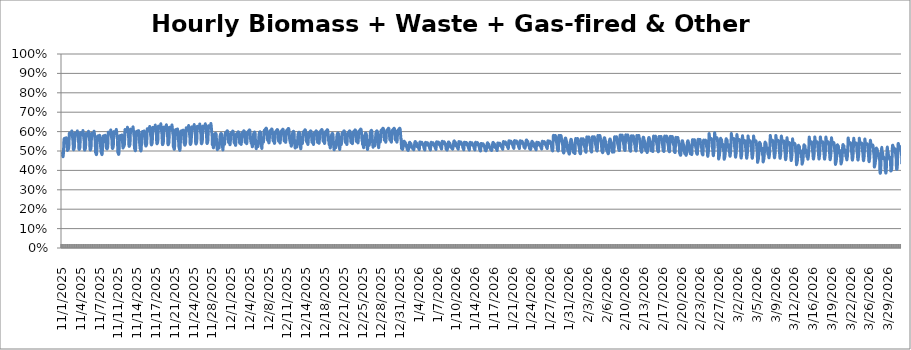
| Category | Series 0 |
|---|---|
| 11/1/25 | 0.484 |
| 11/1/25 | 0.489 |
| 11/1/25 | 0.478 |
| 11/1/25 | 0.473 |
| 11/1/25 | 0.471 |
| 11/1/25 | 0.476 |
| 11/1/25 | 0.497 |
| 11/1/25 | 0.535 |
| 11/1/25 | 0.555 |
| 11/1/25 | 0.564 |
| 11/1/25 | 0.563 |
| 11/1/25 | 0.56 |
| 11/1/25 | 0.565 |
| 11/1/25 | 0.565 |
| 11/1/25 | 0.563 |
| 11/1/25 | 0.562 |
| 11/1/25 | 0.561 |
| 11/1/25 | 0.561 |
| 11/1/25 | 0.568 |
| 11/1/25 | 0.558 |
| 11/1/25 | 0.542 |
| 11/1/25 | 0.526 |
| 11/1/25 | 0.509 |
| 11/1/25 | 0.503 |
| 11/2/25 | 0.514 |
| 11/2/25 | 0.507 |
| 11/2/25 | 0.507 |
| 11/2/25 | 0.51 |
| 11/2/25 | 0.513 |
| 11/2/25 | 0.52 |
| 11/2/25 | 0.547 |
| 11/2/25 | 0.587 |
| 11/2/25 | 0.592 |
| 11/2/25 | 0.588 |
| 11/2/25 | 0.584 |
| 11/2/25 | 0.584 |
| 11/2/25 | 0.583 |
| 11/2/25 | 0.583 |
| 11/2/25 | 0.586 |
| 11/2/25 | 0.589 |
| 11/2/25 | 0.592 |
| 11/2/25 | 0.596 |
| 11/2/25 | 0.604 |
| 11/2/25 | 0.594 |
| 11/2/25 | 0.582 |
| 11/2/25 | 0.57 |
| 11/2/25 | 0.558 |
| 11/2/25 | 0.55 |
| 11/3/25 | 0.514 |
| 11/3/25 | 0.507 |
| 11/3/25 | 0.507 |
| 11/3/25 | 0.51 |
| 11/3/25 | 0.513 |
| 11/3/25 | 0.52 |
| 11/3/25 | 0.547 |
| 11/3/25 | 0.587 |
| 11/3/25 | 0.592 |
| 11/3/25 | 0.588 |
| 11/3/25 | 0.585 |
| 11/3/25 | 0.584 |
| 11/3/25 | 0.583 |
| 11/3/25 | 0.583 |
| 11/3/25 | 0.587 |
| 11/3/25 | 0.589 |
| 11/3/25 | 0.592 |
| 11/3/25 | 0.596 |
| 11/3/25 | 0.604 |
| 11/3/25 | 0.595 |
| 11/3/25 | 0.583 |
| 11/3/25 | 0.57 |
| 11/3/25 | 0.558 |
| 11/3/25 | 0.55 |
| 11/4/25 | 0.515 |
| 11/4/25 | 0.509 |
| 11/4/25 | 0.508 |
| 11/4/25 | 0.511 |
| 11/4/25 | 0.515 |
| 11/4/25 | 0.521 |
| 11/4/25 | 0.549 |
| 11/4/25 | 0.589 |
| 11/4/25 | 0.594 |
| 11/4/25 | 0.59 |
| 11/4/25 | 0.586 |
| 11/4/25 | 0.586 |
| 11/4/25 | 0.585 |
| 11/4/25 | 0.584 |
| 11/4/25 | 0.588 |
| 11/4/25 | 0.59 |
| 11/4/25 | 0.594 |
| 11/4/25 | 0.598 |
| 11/4/25 | 0.605 |
| 11/4/25 | 0.596 |
| 11/4/25 | 0.584 |
| 11/4/25 | 0.572 |
| 11/4/25 | 0.559 |
| 11/4/25 | 0.551 |
| 11/5/25 | 0.512 |
| 11/5/25 | 0.505 |
| 11/5/25 | 0.505 |
| 11/5/25 | 0.508 |
| 11/5/25 | 0.511 |
| 11/5/25 | 0.518 |
| 11/5/25 | 0.545 |
| 11/5/25 | 0.585 |
| 11/5/25 | 0.59 |
| 11/5/25 | 0.586 |
| 11/5/25 | 0.582 |
| 11/5/25 | 0.582 |
| 11/5/25 | 0.581 |
| 11/5/25 | 0.581 |
| 11/5/25 | 0.584 |
| 11/5/25 | 0.586 |
| 11/5/25 | 0.59 |
| 11/5/25 | 0.594 |
| 11/5/25 | 0.601 |
| 11/5/25 | 0.592 |
| 11/5/25 | 0.58 |
| 11/5/25 | 0.568 |
| 11/5/25 | 0.556 |
| 11/5/25 | 0.548 |
| 11/6/25 | 0.513 |
| 11/6/25 | 0.506 |
| 11/6/25 | 0.505 |
| 11/6/25 | 0.508 |
| 11/6/25 | 0.512 |
| 11/6/25 | 0.519 |
| 11/6/25 | 0.546 |
| 11/6/25 | 0.586 |
| 11/6/25 | 0.591 |
| 11/6/25 | 0.587 |
| 11/6/25 | 0.583 |
| 11/6/25 | 0.582 |
| 11/6/25 | 0.582 |
| 11/6/25 | 0.581 |
| 11/6/25 | 0.585 |
| 11/6/25 | 0.587 |
| 11/6/25 | 0.591 |
| 11/6/25 | 0.595 |
| 11/6/25 | 0.602 |
| 11/6/25 | 0.593 |
| 11/6/25 | 0.581 |
| 11/6/25 | 0.569 |
| 11/6/25 | 0.556 |
| 11/6/25 | 0.548 |
| 11/7/25 | 0.495 |
| 11/7/25 | 0.5 |
| 11/7/25 | 0.488 |
| 11/7/25 | 0.484 |
| 11/7/25 | 0.481 |
| 11/7/25 | 0.487 |
| 11/7/25 | 0.508 |
| 11/7/25 | 0.547 |
| 11/7/25 | 0.568 |
| 11/7/25 | 0.576 |
| 11/7/25 | 0.576 |
| 11/7/25 | 0.573 |
| 11/7/25 | 0.578 |
| 11/7/25 | 0.578 |
| 11/7/25 | 0.576 |
| 11/7/25 | 0.575 |
| 11/7/25 | 0.573 |
| 11/7/25 | 0.574 |
| 11/7/25 | 0.581 |
| 11/7/25 | 0.571 |
| 11/7/25 | 0.555 |
| 11/7/25 | 0.538 |
| 11/7/25 | 0.521 |
| 11/7/25 | 0.514 |
| 11/8/25 | 0.495 |
| 11/8/25 | 0.5 |
| 11/8/25 | 0.488 |
| 11/8/25 | 0.484 |
| 11/8/25 | 0.481 |
| 11/8/25 | 0.487 |
| 11/8/25 | 0.508 |
| 11/8/25 | 0.547 |
| 11/8/25 | 0.568 |
| 11/8/25 | 0.576 |
| 11/8/25 | 0.576 |
| 11/8/25 | 0.573 |
| 11/8/25 | 0.578 |
| 11/8/25 | 0.578 |
| 11/8/25 | 0.576 |
| 11/8/25 | 0.575 |
| 11/8/25 | 0.573 |
| 11/8/25 | 0.574 |
| 11/8/25 | 0.581 |
| 11/8/25 | 0.571 |
| 11/8/25 | 0.555 |
| 11/8/25 | 0.538 |
| 11/8/25 | 0.521 |
| 11/8/25 | 0.514 |
| 11/9/25 | 0.518 |
| 11/9/25 | 0.511 |
| 11/9/25 | 0.511 |
| 11/9/25 | 0.514 |
| 11/9/25 | 0.517 |
| 11/9/25 | 0.524 |
| 11/9/25 | 0.552 |
| 11/9/25 | 0.592 |
| 11/9/25 | 0.597 |
| 11/9/25 | 0.593 |
| 11/9/25 | 0.589 |
| 11/9/25 | 0.589 |
| 11/9/25 | 0.588 |
| 11/9/25 | 0.587 |
| 11/9/25 | 0.591 |
| 11/9/25 | 0.594 |
| 11/9/25 | 0.597 |
| 11/9/25 | 0.601 |
| 11/9/25 | 0.609 |
| 11/9/25 | 0.599 |
| 11/9/25 | 0.587 |
| 11/9/25 | 0.575 |
| 11/9/25 | 0.562 |
| 11/9/25 | 0.554 |
| 11/10/25 | 0.52 |
| 11/10/25 | 0.514 |
| 11/10/25 | 0.513 |
| 11/10/25 | 0.516 |
| 11/10/25 | 0.52 |
| 11/10/25 | 0.526 |
| 11/10/25 | 0.554 |
| 11/10/25 | 0.595 |
| 11/10/25 | 0.6 |
| 11/10/25 | 0.596 |
| 11/10/25 | 0.592 |
| 11/10/25 | 0.591 |
| 11/10/25 | 0.59 |
| 11/10/25 | 0.59 |
| 11/10/25 | 0.594 |
| 11/10/25 | 0.596 |
| 11/10/25 | 0.6 |
| 11/10/25 | 0.604 |
| 11/10/25 | 0.611 |
| 11/10/25 | 0.602 |
| 11/10/25 | 0.59 |
| 11/10/25 | 0.577 |
| 11/10/25 | 0.565 |
| 11/10/25 | 0.557 |
| 11/11/25 | 0.496 |
| 11/11/25 | 0.502 |
| 11/11/25 | 0.49 |
| 11/11/25 | 0.485 |
| 11/11/25 | 0.483 |
| 11/11/25 | 0.488 |
| 11/11/25 | 0.51 |
| 11/11/25 | 0.549 |
| 11/11/25 | 0.569 |
| 11/11/25 | 0.578 |
| 11/11/25 | 0.577 |
| 11/11/25 | 0.575 |
| 11/11/25 | 0.58 |
| 11/11/25 | 0.579 |
| 11/11/25 | 0.578 |
| 11/11/25 | 0.577 |
| 11/11/25 | 0.575 |
| 11/11/25 | 0.575 |
| 11/11/25 | 0.583 |
| 11/11/25 | 0.572 |
| 11/11/25 | 0.556 |
| 11/11/25 | 0.54 |
| 11/11/25 | 0.522 |
| 11/11/25 | 0.516 |
| 11/12/25 | 0.53 |
| 11/12/25 | 0.523 |
| 11/12/25 | 0.522 |
| 11/12/25 | 0.525 |
| 11/12/25 | 0.529 |
| 11/12/25 | 0.536 |
| 11/12/25 | 0.564 |
| 11/12/25 | 0.606 |
| 11/12/25 | 0.61 |
| 11/12/25 | 0.607 |
| 11/12/25 | 0.603 |
| 11/12/25 | 0.602 |
| 11/12/25 | 0.601 |
| 11/12/25 | 0.601 |
| 11/12/25 | 0.605 |
| 11/12/25 | 0.607 |
| 11/12/25 | 0.611 |
| 11/12/25 | 0.615 |
| 11/12/25 | 0.622 |
| 11/12/25 | 0.613 |
| 11/12/25 | 0.601 |
| 11/12/25 | 0.588 |
| 11/12/25 | 0.575 |
| 11/12/25 | 0.567 |
| 11/13/25 | 0.532 |
| 11/13/25 | 0.525 |
| 11/13/25 | 0.524 |
| 11/13/25 | 0.527 |
| 11/13/25 | 0.531 |
| 11/13/25 | 0.538 |
| 11/13/25 | 0.566 |
| 11/13/25 | 0.608 |
| 11/13/25 | 0.612 |
| 11/13/25 | 0.609 |
| 11/13/25 | 0.605 |
| 11/13/25 | 0.604 |
| 11/13/25 | 0.603 |
| 11/13/25 | 0.603 |
| 11/13/25 | 0.607 |
| 11/13/25 | 0.609 |
| 11/13/25 | 0.613 |
| 11/13/25 | 0.617 |
| 11/13/25 | 0.624 |
| 11/13/25 | 0.615 |
| 11/13/25 | 0.603 |
| 11/13/25 | 0.59 |
| 11/13/25 | 0.577 |
| 11/13/25 | 0.569 |
| 11/14/25 | 0.515 |
| 11/14/25 | 0.521 |
| 11/14/25 | 0.509 |
| 11/14/25 | 0.504 |
| 11/14/25 | 0.502 |
| 11/14/25 | 0.507 |
| 11/14/25 | 0.529 |
| 11/14/25 | 0.57 |
| 11/14/25 | 0.591 |
| 11/14/25 | 0.6 |
| 11/14/25 | 0.6 |
| 11/14/25 | 0.597 |
| 11/14/25 | 0.602 |
| 11/14/25 | 0.602 |
| 11/14/25 | 0.6 |
| 11/14/25 | 0.599 |
| 11/14/25 | 0.597 |
| 11/14/25 | 0.597 |
| 11/14/25 | 0.605 |
| 11/14/25 | 0.594 |
| 11/14/25 | 0.578 |
| 11/14/25 | 0.561 |
| 11/14/25 | 0.542 |
| 11/14/25 | 0.536 |
| 11/15/25 | 0.514 |
| 11/15/25 | 0.52 |
| 11/15/25 | 0.507 |
| 11/15/25 | 0.503 |
| 11/15/25 | 0.5 |
| 11/15/25 | 0.506 |
| 11/15/25 | 0.528 |
| 11/15/25 | 0.568 |
| 11/15/25 | 0.59 |
| 11/15/25 | 0.599 |
| 11/15/25 | 0.598 |
| 11/15/25 | 0.595 |
| 11/15/25 | 0.601 |
| 11/15/25 | 0.6 |
| 11/15/25 | 0.599 |
| 11/15/25 | 0.597 |
| 11/15/25 | 0.596 |
| 11/15/25 | 0.596 |
| 11/15/25 | 0.604 |
| 11/15/25 | 0.593 |
| 11/15/25 | 0.576 |
| 11/15/25 | 0.559 |
| 11/15/25 | 0.541 |
| 11/15/25 | 0.534 |
| 11/16/25 | 0.533 |
| 11/16/25 | 0.526 |
| 11/16/25 | 0.526 |
| 11/16/25 | 0.529 |
| 11/16/25 | 0.533 |
| 11/16/25 | 0.54 |
| 11/16/25 | 0.568 |
| 11/16/25 | 0.61 |
| 11/16/25 | 0.614 |
| 11/16/25 | 0.611 |
| 11/16/25 | 0.607 |
| 11/16/25 | 0.606 |
| 11/16/25 | 0.605 |
| 11/16/25 | 0.605 |
| 11/16/25 | 0.609 |
| 11/16/25 | 0.611 |
| 11/16/25 | 0.615 |
| 11/16/25 | 0.619 |
| 11/16/25 | 0.627 |
| 11/16/25 | 0.617 |
| 11/16/25 | 0.605 |
| 11/16/25 | 0.592 |
| 11/16/25 | 0.579 |
| 11/16/25 | 0.571 |
| 11/17/25 | 0.539 |
| 11/17/25 | 0.532 |
| 11/17/25 | 0.532 |
| 11/17/25 | 0.535 |
| 11/17/25 | 0.539 |
| 11/17/25 | 0.546 |
| 11/17/25 | 0.574 |
| 11/17/25 | 0.616 |
| 11/17/25 | 0.621 |
| 11/17/25 | 0.617 |
| 11/17/25 | 0.613 |
| 11/17/25 | 0.613 |
| 11/17/25 | 0.612 |
| 11/17/25 | 0.612 |
| 11/17/25 | 0.616 |
| 11/17/25 | 0.618 |
| 11/17/25 | 0.622 |
| 11/17/25 | 0.626 |
| 11/17/25 | 0.634 |
| 11/17/25 | 0.624 |
| 11/17/25 | 0.611 |
| 11/17/25 | 0.598 |
| 11/17/25 | 0.585 |
| 11/17/25 | 0.577 |
| 11/18/25 | 0.545 |
| 11/18/25 | 0.538 |
| 11/18/25 | 0.537 |
| 11/18/25 | 0.54 |
| 11/18/25 | 0.544 |
| 11/18/25 | 0.551 |
| 11/18/25 | 0.58 |
| 11/18/25 | 0.623 |
| 11/18/25 | 0.628 |
| 11/18/25 | 0.624 |
| 11/18/25 | 0.62 |
| 11/18/25 | 0.619 |
| 11/18/25 | 0.618 |
| 11/18/25 | 0.618 |
| 11/18/25 | 0.622 |
| 11/18/25 | 0.624 |
| 11/18/25 | 0.628 |
| 11/18/25 | 0.632 |
| 11/18/25 | 0.64 |
| 11/18/25 | 0.631 |
| 11/18/25 | 0.618 |
| 11/18/25 | 0.604 |
| 11/18/25 | 0.591 |
| 11/18/25 | 0.583 |
| 11/19/25 | 0.541 |
| 11/19/25 | 0.533 |
| 11/19/25 | 0.533 |
| 11/19/25 | 0.536 |
| 11/19/25 | 0.54 |
| 11/19/25 | 0.547 |
| 11/19/25 | 0.576 |
| 11/19/25 | 0.618 |
| 11/19/25 | 0.623 |
| 11/19/25 | 0.619 |
| 11/19/25 | 0.615 |
| 11/19/25 | 0.614 |
| 11/19/25 | 0.613 |
| 11/19/25 | 0.613 |
| 11/19/25 | 0.617 |
| 11/19/25 | 0.619 |
| 11/19/25 | 0.623 |
| 11/19/25 | 0.627 |
| 11/19/25 | 0.635 |
| 11/19/25 | 0.625 |
| 11/19/25 | 0.613 |
| 11/19/25 | 0.6 |
| 11/19/25 | 0.587 |
| 11/19/25 | 0.578 |
| 11/20/25 | 0.54 |
| 11/20/25 | 0.533 |
| 11/20/25 | 0.532 |
| 11/20/25 | 0.535 |
| 11/20/25 | 0.539 |
| 11/20/25 | 0.546 |
| 11/20/25 | 0.575 |
| 11/20/25 | 0.617 |
| 11/20/25 | 0.622 |
| 11/20/25 | 0.618 |
| 11/20/25 | 0.614 |
| 11/20/25 | 0.613 |
| 11/20/25 | 0.613 |
| 11/20/25 | 0.612 |
| 11/20/25 | 0.616 |
| 11/20/25 | 0.619 |
| 11/20/25 | 0.623 |
| 11/20/25 | 0.626 |
| 11/20/25 | 0.634 |
| 11/20/25 | 0.625 |
| 11/20/25 | 0.612 |
| 11/20/25 | 0.599 |
| 11/20/25 | 0.586 |
| 11/20/25 | 0.578 |
| 11/21/25 | 0.523 |
| 11/21/25 | 0.529 |
| 11/21/25 | 0.516 |
| 11/21/25 | 0.511 |
| 11/21/25 | 0.508 |
| 11/21/25 | 0.514 |
| 11/21/25 | 0.537 |
| 11/21/25 | 0.578 |
| 11/21/25 | 0.6 |
| 11/21/25 | 0.609 |
| 11/21/25 | 0.608 |
| 11/21/25 | 0.605 |
| 11/21/25 | 0.611 |
| 11/21/25 | 0.61 |
| 11/21/25 | 0.609 |
| 11/21/25 | 0.607 |
| 11/21/25 | 0.606 |
| 11/21/25 | 0.606 |
| 11/21/25 | 0.614 |
| 11/21/25 | 0.603 |
| 11/21/25 | 0.586 |
| 11/21/25 | 0.568 |
| 11/21/25 | 0.55 |
| 11/21/25 | 0.543 |
| 11/22/25 | 0.517 |
| 11/22/25 | 0.523 |
| 11/22/25 | 0.511 |
| 11/22/25 | 0.506 |
| 11/22/25 | 0.504 |
| 11/22/25 | 0.509 |
| 11/22/25 | 0.531 |
| 11/22/25 | 0.572 |
| 11/22/25 | 0.594 |
| 11/22/25 | 0.603 |
| 11/22/25 | 0.602 |
| 11/22/25 | 0.599 |
| 11/22/25 | 0.605 |
| 11/22/25 | 0.604 |
| 11/22/25 | 0.603 |
| 11/22/25 | 0.601 |
| 11/22/25 | 0.6 |
| 11/22/25 | 0.6 |
| 11/22/25 | 0.608 |
| 11/22/25 | 0.597 |
| 11/22/25 | 0.58 |
| 11/22/25 | 0.563 |
| 11/22/25 | 0.545 |
| 11/22/25 | 0.538 |
| 11/23/25 | 0.538 |
| 11/23/25 | 0.53 |
| 11/23/25 | 0.53 |
| 11/23/25 | 0.533 |
| 11/23/25 | 0.537 |
| 11/23/25 | 0.544 |
| 11/23/25 | 0.572 |
| 11/23/25 | 0.614 |
| 11/23/25 | 0.619 |
| 11/23/25 | 0.615 |
| 11/23/25 | 0.611 |
| 11/23/25 | 0.611 |
| 11/23/25 | 0.61 |
| 11/23/25 | 0.61 |
| 11/23/25 | 0.614 |
| 11/23/25 | 0.616 |
| 11/23/25 | 0.62 |
| 11/23/25 | 0.624 |
| 11/23/25 | 0.632 |
| 11/23/25 | 0.622 |
| 11/23/25 | 0.609 |
| 11/23/25 | 0.596 |
| 11/23/25 | 0.583 |
| 11/23/25 | 0.575 |
| 11/24/25 | 0.542 |
| 11/24/25 | 0.534 |
| 11/24/25 | 0.534 |
| 11/24/25 | 0.537 |
| 11/24/25 | 0.541 |
| 11/24/25 | 0.548 |
| 11/24/25 | 0.577 |
| 11/24/25 | 0.619 |
| 11/24/25 | 0.624 |
| 11/24/25 | 0.62 |
| 11/24/25 | 0.616 |
| 11/24/25 | 0.615 |
| 11/24/25 | 0.614 |
| 11/24/25 | 0.614 |
| 11/24/25 | 0.618 |
| 11/24/25 | 0.62 |
| 11/24/25 | 0.624 |
| 11/24/25 | 0.628 |
| 11/24/25 | 0.636 |
| 11/24/25 | 0.627 |
| 11/24/25 | 0.614 |
| 11/24/25 | 0.601 |
| 11/24/25 | 0.588 |
| 11/24/25 | 0.579 |
| 11/25/25 | 0.544 |
| 11/25/25 | 0.537 |
| 11/25/25 | 0.536 |
| 11/25/25 | 0.539 |
| 11/25/25 | 0.543 |
| 11/25/25 | 0.55 |
| 11/25/25 | 0.579 |
| 11/25/25 | 0.622 |
| 11/25/25 | 0.627 |
| 11/25/25 | 0.623 |
| 11/25/25 | 0.619 |
| 11/25/25 | 0.618 |
| 11/25/25 | 0.617 |
| 11/25/25 | 0.617 |
| 11/25/25 | 0.621 |
| 11/25/25 | 0.623 |
| 11/25/25 | 0.627 |
| 11/25/25 | 0.631 |
| 11/25/25 | 0.639 |
| 11/25/25 | 0.629 |
| 11/25/25 | 0.617 |
| 11/25/25 | 0.603 |
| 11/25/25 | 0.59 |
| 11/25/25 | 0.582 |
| 11/26/25 | 0.545 |
| 11/26/25 | 0.538 |
| 11/26/25 | 0.537 |
| 11/26/25 | 0.541 |
| 11/26/25 | 0.544 |
| 11/26/25 | 0.551 |
| 11/26/25 | 0.58 |
| 11/26/25 | 0.623 |
| 11/26/25 | 0.628 |
| 11/26/25 | 0.624 |
| 11/26/25 | 0.62 |
| 11/26/25 | 0.619 |
| 11/26/25 | 0.618 |
| 11/26/25 | 0.618 |
| 11/26/25 | 0.622 |
| 11/26/25 | 0.624 |
| 11/26/25 | 0.628 |
| 11/26/25 | 0.632 |
| 11/26/25 | 0.64 |
| 11/26/25 | 0.631 |
| 11/26/25 | 0.618 |
| 11/26/25 | 0.605 |
| 11/26/25 | 0.591 |
| 11/26/25 | 0.583 |
| 11/27/25 | 0.547 |
| 11/27/25 | 0.539 |
| 11/27/25 | 0.539 |
| 11/27/25 | 0.542 |
| 11/27/25 | 0.546 |
| 11/27/25 | 0.553 |
| 11/27/25 | 0.582 |
| 11/27/25 | 0.625 |
| 11/27/25 | 0.63 |
| 11/27/25 | 0.626 |
| 11/27/25 | 0.622 |
| 11/27/25 | 0.621 |
| 11/27/25 | 0.62 |
| 11/27/25 | 0.62 |
| 11/27/25 | 0.624 |
| 11/27/25 | 0.626 |
| 11/27/25 | 0.63 |
| 11/27/25 | 0.634 |
| 11/27/25 | 0.642 |
| 11/27/25 | 0.632 |
| 11/27/25 | 0.62 |
| 11/27/25 | 0.606 |
| 11/27/25 | 0.593 |
| 11/27/25 | 0.585 |
| 11/28/25 | 0.534 |
| 11/28/25 | 0.542 |
| 11/28/25 | 0.538 |
| 11/28/25 | 0.531 |
| 11/28/25 | 0.52 |
| 11/28/25 | 0.516 |
| 11/28/25 | 0.525 |
| 11/28/25 | 0.535 |
| 11/28/25 | 0.553 |
| 11/28/25 | 0.57 |
| 11/28/25 | 0.582 |
| 11/28/25 | 0.584 |
| 11/28/25 | 0.59 |
| 11/28/25 | 0.588 |
| 11/28/25 | 0.592 |
| 11/28/25 | 0.59 |
| 11/28/25 | 0.589 |
| 11/28/25 | 0.582 |
| 11/28/25 | 0.552 |
| 11/28/25 | 0.536 |
| 11/28/25 | 0.523 |
| 11/28/25 | 0.51 |
| 11/28/25 | 0.508 |
| 11/28/25 | 0.526 |
| 11/29/25 | 0.533 |
| 11/29/25 | 0.541 |
| 11/29/25 | 0.537 |
| 11/29/25 | 0.53 |
| 11/29/25 | 0.519 |
| 11/29/25 | 0.515 |
| 11/29/25 | 0.524 |
| 11/29/25 | 0.533 |
| 11/29/25 | 0.551 |
| 11/29/25 | 0.569 |
| 11/29/25 | 0.58 |
| 11/29/25 | 0.583 |
| 11/29/25 | 0.588 |
| 11/29/25 | 0.587 |
| 11/29/25 | 0.59 |
| 11/29/25 | 0.589 |
| 11/29/25 | 0.587 |
| 11/29/25 | 0.58 |
| 11/29/25 | 0.551 |
| 11/29/25 | 0.535 |
| 11/29/25 | 0.522 |
| 11/29/25 | 0.509 |
| 11/29/25 | 0.507 |
| 11/29/25 | 0.525 |
| 11/30/25 | 0.546 |
| 11/30/25 | 0.543 |
| 11/30/25 | 0.542 |
| 11/30/25 | 0.54 |
| 11/30/25 | 0.534 |
| 11/30/25 | 0.537 |
| 11/30/25 | 0.552 |
| 11/30/25 | 0.579 |
| 11/30/25 | 0.593 |
| 11/30/25 | 0.593 |
| 11/30/25 | 0.595 |
| 11/30/25 | 0.595 |
| 11/30/25 | 0.598 |
| 11/30/25 | 0.599 |
| 11/30/25 | 0.6 |
| 11/30/25 | 0.602 |
| 11/30/25 | 0.604 |
| 11/30/25 | 0.602 |
| 11/30/25 | 0.602 |
| 11/30/25 | 0.591 |
| 11/30/25 | 0.579 |
| 11/30/25 | 0.559 |
| 11/30/25 | 0.545 |
| 11/30/25 | 0.549 |
| 12/1/25 | 0.544 |
| 12/1/25 | 0.542 |
| 12/1/25 | 0.54 |
| 12/1/25 | 0.539 |
| 12/1/25 | 0.533 |
| 12/1/25 | 0.535 |
| 12/1/25 | 0.55 |
| 12/1/25 | 0.577 |
| 12/1/25 | 0.591 |
| 12/1/25 | 0.592 |
| 12/1/25 | 0.594 |
| 12/1/25 | 0.594 |
| 12/1/25 | 0.597 |
| 12/1/25 | 0.598 |
| 12/1/25 | 0.599 |
| 12/1/25 | 0.601 |
| 12/1/25 | 0.603 |
| 12/1/25 | 0.601 |
| 12/1/25 | 0.6 |
| 12/1/25 | 0.59 |
| 12/1/25 | 0.577 |
| 12/1/25 | 0.558 |
| 12/1/25 | 0.544 |
| 12/1/25 | 0.548 |
| 12/2/25 | 0.541 |
| 12/2/25 | 0.539 |
| 12/2/25 | 0.537 |
| 12/2/25 | 0.536 |
| 12/2/25 | 0.529 |
| 12/2/25 | 0.532 |
| 12/2/25 | 0.547 |
| 12/2/25 | 0.573 |
| 12/2/25 | 0.587 |
| 12/2/25 | 0.588 |
| 12/2/25 | 0.59 |
| 12/2/25 | 0.59 |
| 12/2/25 | 0.593 |
| 12/2/25 | 0.594 |
| 12/2/25 | 0.595 |
| 12/2/25 | 0.597 |
| 12/2/25 | 0.599 |
| 12/2/25 | 0.597 |
| 12/2/25 | 0.596 |
| 12/2/25 | 0.586 |
| 12/2/25 | 0.574 |
| 12/2/25 | 0.554 |
| 12/2/25 | 0.54 |
| 12/2/25 | 0.544 |
| 12/3/25 | 0.546 |
| 12/3/25 | 0.543 |
| 12/3/25 | 0.542 |
| 12/3/25 | 0.54 |
| 12/3/25 | 0.534 |
| 12/3/25 | 0.537 |
| 12/3/25 | 0.552 |
| 12/3/25 | 0.579 |
| 12/3/25 | 0.593 |
| 12/3/25 | 0.593 |
| 12/3/25 | 0.595 |
| 12/3/25 | 0.595 |
| 12/3/25 | 0.598 |
| 12/3/25 | 0.599 |
| 12/3/25 | 0.6 |
| 12/3/25 | 0.602 |
| 12/3/25 | 0.604 |
| 12/3/25 | 0.603 |
| 12/3/25 | 0.602 |
| 12/3/25 | 0.591 |
| 12/3/25 | 0.579 |
| 12/3/25 | 0.559 |
| 12/3/25 | 0.545 |
| 12/3/25 | 0.549 |
| 12/4/25 | 0.55 |
| 12/4/25 | 0.547 |
| 12/4/25 | 0.546 |
| 12/4/25 | 0.544 |
| 12/4/25 | 0.538 |
| 12/4/25 | 0.541 |
| 12/4/25 | 0.556 |
| 12/4/25 | 0.583 |
| 12/4/25 | 0.597 |
| 12/4/25 | 0.597 |
| 12/4/25 | 0.6 |
| 12/4/25 | 0.6 |
| 12/4/25 | 0.602 |
| 12/4/25 | 0.604 |
| 12/4/25 | 0.604 |
| 12/4/25 | 0.606 |
| 12/4/25 | 0.609 |
| 12/4/25 | 0.607 |
| 12/4/25 | 0.606 |
| 12/4/25 | 0.595 |
| 12/4/25 | 0.583 |
| 12/4/25 | 0.563 |
| 12/4/25 | 0.549 |
| 12/4/25 | 0.553 |
| 12/5/25 | 0.54 |
| 12/5/25 | 0.548 |
| 12/5/25 | 0.544 |
| 12/5/25 | 0.537 |
| 12/5/25 | 0.525 |
| 12/5/25 | 0.522 |
| 12/5/25 | 0.531 |
| 12/5/25 | 0.54 |
| 12/5/25 | 0.558 |
| 12/5/25 | 0.576 |
| 12/5/25 | 0.588 |
| 12/5/25 | 0.59 |
| 12/5/25 | 0.596 |
| 12/5/25 | 0.594 |
| 12/5/25 | 0.598 |
| 12/5/25 | 0.596 |
| 12/5/25 | 0.595 |
| 12/5/25 | 0.588 |
| 12/5/25 | 0.558 |
| 12/5/25 | 0.542 |
| 12/5/25 | 0.529 |
| 12/5/25 | 0.515 |
| 12/5/25 | 0.513 |
| 12/5/25 | 0.532 |
| 12/6/25 | 0.541 |
| 12/6/25 | 0.549 |
| 12/6/25 | 0.545 |
| 12/6/25 | 0.538 |
| 12/6/25 | 0.526 |
| 12/6/25 | 0.523 |
| 12/6/25 | 0.532 |
| 12/6/25 | 0.541 |
| 12/6/25 | 0.56 |
| 12/6/25 | 0.577 |
| 12/6/25 | 0.589 |
| 12/6/25 | 0.591 |
| 12/6/25 | 0.597 |
| 12/6/25 | 0.595 |
| 12/6/25 | 0.599 |
| 12/6/25 | 0.597 |
| 12/6/25 | 0.596 |
| 12/6/25 | 0.589 |
| 12/6/25 | 0.559 |
| 12/6/25 | 0.543 |
| 12/6/25 | 0.53 |
| 12/6/25 | 0.516 |
| 12/6/25 | 0.514 |
| 12/6/25 | 0.533 |
| 12/7/25 | 0.558 |
| 12/7/25 | 0.556 |
| 12/7/25 | 0.554 |
| 12/7/25 | 0.552 |
| 12/7/25 | 0.546 |
| 12/7/25 | 0.549 |
| 12/7/25 | 0.564 |
| 12/7/25 | 0.591 |
| 12/7/25 | 0.606 |
| 12/7/25 | 0.606 |
| 12/7/25 | 0.608 |
| 12/7/25 | 0.608 |
| 12/7/25 | 0.611 |
| 12/7/25 | 0.613 |
| 12/7/25 | 0.613 |
| 12/7/25 | 0.615 |
| 12/7/25 | 0.618 |
| 12/7/25 | 0.616 |
| 12/7/25 | 0.615 |
| 12/7/25 | 0.604 |
| 12/7/25 | 0.592 |
| 12/7/25 | 0.572 |
| 12/7/25 | 0.557 |
| 12/7/25 | 0.561 |
| 12/8/25 | 0.554 |
| 12/8/25 | 0.552 |
| 12/8/25 | 0.55 |
| 12/8/25 | 0.549 |
| 12/8/25 | 0.542 |
| 12/8/25 | 0.545 |
| 12/8/25 | 0.56 |
| 12/8/25 | 0.587 |
| 12/8/25 | 0.602 |
| 12/8/25 | 0.602 |
| 12/8/25 | 0.604 |
| 12/8/25 | 0.604 |
| 12/8/25 | 0.607 |
| 12/8/25 | 0.608 |
| 12/8/25 | 0.609 |
| 12/8/25 | 0.611 |
| 12/8/25 | 0.614 |
| 12/8/25 | 0.612 |
| 12/8/25 | 0.611 |
| 12/8/25 | 0.6 |
| 12/8/25 | 0.587 |
| 12/8/25 | 0.568 |
| 12/8/25 | 0.553 |
| 12/8/25 | 0.557 |
| 12/9/25 | 0.551 |
| 12/9/25 | 0.549 |
| 12/9/25 | 0.547 |
| 12/9/25 | 0.546 |
| 12/9/25 | 0.539 |
| 12/9/25 | 0.542 |
| 12/9/25 | 0.557 |
| 12/9/25 | 0.584 |
| 12/9/25 | 0.599 |
| 12/9/25 | 0.599 |
| 12/9/25 | 0.601 |
| 12/9/25 | 0.601 |
| 12/9/25 | 0.604 |
| 12/9/25 | 0.605 |
| 12/9/25 | 0.606 |
| 12/9/25 | 0.608 |
| 12/9/25 | 0.611 |
| 12/9/25 | 0.609 |
| 12/9/25 | 0.608 |
| 12/9/25 | 0.597 |
| 12/9/25 | 0.585 |
| 12/9/25 | 0.565 |
| 12/9/25 | 0.551 |
| 12/9/25 | 0.555 |
| 12/10/25 | 0.553 |
| 12/10/25 | 0.551 |
| 12/10/25 | 0.549 |
| 12/10/25 | 0.548 |
| 12/10/25 | 0.541 |
| 12/10/25 | 0.544 |
| 12/10/25 | 0.559 |
| 12/10/25 | 0.586 |
| 12/10/25 | 0.601 |
| 12/10/25 | 0.601 |
| 12/10/25 | 0.603 |
| 12/10/25 | 0.603 |
| 12/10/25 | 0.606 |
| 12/10/25 | 0.607 |
| 12/10/25 | 0.608 |
| 12/10/25 | 0.61 |
| 12/10/25 | 0.613 |
| 12/10/25 | 0.611 |
| 12/10/25 | 0.61 |
| 12/10/25 | 0.599 |
| 12/10/25 | 0.587 |
| 12/10/25 | 0.567 |
| 12/10/25 | 0.552 |
| 12/10/25 | 0.557 |
| 12/11/25 | 0.557 |
| 12/11/25 | 0.554 |
| 12/11/25 | 0.552 |
| 12/11/25 | 0.551 |
| 12/11/25 | 0.545 |
| 12/11/25 | 0.547 |
| 12/11/25 | 0.563 |
| 12/11/25 | 0.59 |
| 12/11/25 | 0.604 |
| 12/11/25 | 0.605 |
| 12/11/25 | 0.607 |
| 12/11/25 | 0.607 |
| 12/11/25 | 0.61 |
| 12/11/25 | 0.611 |
| 12/11/25 | 0.612 |
| 12/11/25 | 0.614 |
| 12/11/25 | 0.617 |
| 12/11/25 | 0.615 |
| 12/11/25 | 0.614 |
| 12/11/25 | 0.603 |
| 12/11/25 | 0.59 |
| 12/11/25 | 0.57 |
| 12/11/25 | 0.556 |
| 12/11/25 | 0.56 |
| 12/12/25 | 0.543 |
| 12/12/25 | 0.551 |
| 12/12/25 | 0.547 |
| 12/12/25 | 0.54 |
| 12/12/25 | 0.528 |
| 12/12/25 | 0.525 |
| 12/12/25 | 0.534 |
| 12/12/25 | 0.543 |
| 12/12/25 | 0.562 |
| 12/12/25 | 0.579 |
| 12/12/25 | 0.591 |
| 12/12/25 | 0.594 |
| 12/12/25 | 0.6 |
| 12/12/25 | 0.598 |
| 12/12/25 | 0.602 |
| 12/12/25 | 0.6 |
| 12/12/25 | 0.598 |
| 12/12/25 | 0.591 |
| 12/12/25 | 0.562 |
| 12/12/25 | 0.545 |
| 12/12/25 | 0.532 |
| 12/12/25 | 0.519 |
| 12/12/25 | 0.516 |
| 12/12/25 | 0.535 |
| 12/13/25 | 0.539 |
| 12/13/25 | 0.547 |
| 12/13/25 | 0.543 |
| 12/13/25 | 0.536 |
| 12/13/25 | 0.524 |
| 12/13/25 | 0.521 |
| 12/13/25 | 0.53 |
| 12/13/25 | 0.539 |
| 12/13/25 | 0.558 |
| 12/13/25 | 0.575 |
| 12/13/25 | 0.587 |
| 12/13/25 | 0.589 |
| 12/13/25 | 0.595 |
| 12/13/25 | 0.593 |
| 12/13/25 | 0.597 |
| 12/13/25 | 0.595 |
| 12/13/25 | 0.594 |
| 12/13/25 | 0.587 |
| 12/13/25 | 0.557 |
| 12/13/25 | 0.541 |
| 12/13/25 | 0.528 |
| 12/13/25 | 0.515 |
| 12/13/25 | 0.512 |
| 12/13/25 | 0.531 |
| 12/14/25 | 0.55 |
| 12/14/25 | 0.548 |
| 12/14/25 | 0.546 |
| 12/14/25 | 0.545 |
| 12/14/25 | 0.538 |
| 12/14/25 | 0.541 |
| 12/14/25 | 0.556 |
| 12/14/25 | 0.583 |
| 12/14/25 | 0.597 |
| 12/14/25 | 0.598 |
| 12/14/25 | 0.6 |
| 12/14/25 | 0.6 |
| 12/14/25 | 0.603 |
| 12/14/25 | 0.604 |
| 12/14/25 | 0.605 |
| 12/14/25 | 0.607 |
| 12/14/25 | 0.609 |
| 12/14/25 | 0.608 |
| 12/14/25 | 0.607 |
| 12/14/25 | 0.596 |
| 12/14/25 | 0.584 |
| 12/14/25 | 0.564 |
| 12/14/25 | 0.549 |
| 12/14/25 | 0.554 |
| 12/15/25 | 0.545 |
| 12/15/25 | 0.543 |
| 12/15/25 | 0.542 |
| 12/15/25 | 0.54 |
| 12/15/25 | 0.534 |
| 12/15/25 | 0.536 |
| 12/15/25 | 0.552 |
| 12/15/25 | 0.578 |
| 12/15/25 | 0.592 |
| 12/15/25 | 0.593 |
| 12/15/25 | 0.595 |
| 12/15/25 | 0.595 |
| 12/15/25 | 0.598 |
| 12/15/25 | 0.599 |
| 12/15/25 | 0.6 |
| 12/15/25 | 0.602 |
| 12/15/25 | 0.604 |
| 12/15/25 | 0.602 |
| 12/15/25 | 0.602 |
| 12/15/25 | 0.591 |
| 12/15/25 | 0.579 |
| 12/15/25 | 0.559 |
| 12/15/25 | 0.545 |
| 12/15/25 | 0.549 |
| 12/16/25 | 0.545 |
| 12/16/25 | 0.543 |
| 12/16/25 | 0.541 |
| 12/16/25 | 0.54 |
| 12/16/25 | 0.534 |
| 12/16/25 | 0.536 |
| 12/16/25 | 0.551 |
| 12/16/25 | 0.578 |
| 12/16/25 | 0.592 |
| 12/16/25 | 0.593 |
| 12/16/25 | 0.595 |
| 12/16/25 | 0.595 |
| 12/16/25 | 0.598 |
| 12/16/25 | 0.599 |
| 12/16/25 | 0.6 |
| 12/16/25 | 0.602 |
| 12/16/25 | 0.604 |
| 12/16/25 | 0.602 |
| 12/16/25 | 0.602 |
| 12/16/25 | 0.591 |
| 12/16/25 | 0.578 |
| 12/16/25 | 0.559 |
| 12/16/25 | 0.545 |
| 12/16/25 | 0.549 |
| 12/17/25 | 0.551 |
| 12/17/25 | 0.549 |
| 12/17/25 | 0.547 |
| 12/17/25 | 0.546 |
| 12/17/25 | 0.54 |
| 12/17/25 | 0.542 |
| 12/17/25 | 0.557 |
| 12/17/25 | 0.585 |
| 12/17/25 | 0.599 |
| 12/17/25 | 0.599 |
| 12/17/25 | 0.601 |
| 12/17/25 | 0.601 |
| 12/17/25 | 0.604 |
| 12/17/25 | 0.605 |
| 12/17/25 | 0.606 |
| 12/17/25 | 0.608 |
| 12/17/25 | 0.611 |
| 12/17/25 | 0.609 |
| 12/17/25 | 0.608 |
| 12/17/25 | 0.597 |
| 12/17/25 | 0.585 |
| 12/17/25 | 0.565 |
| 12/17/25 | 0.551 |
| 12/17/25 | 0.555 |
| 12/18/25 | 0.551 |
| 12/18/25 | 0.548 |
| 12/18/25 | 0.547 |
| 12/18/25 | 0.545 |
| 12/18/25 | 0.539 |
| 12/18/25 | 0.542 |
| 12/18/25 | 0.557 |
| 12/18/25 | 0.584 |
| 12/18/25 | 0.598 |
| 12/18/25 | 0.598 |
| 12/18/25 | 0.601 |
| 12/18/25 | 0.601 |
| 12/18/25 | 0.604 |
| 12/18/25 | 0.605 |
| 12/18/25 | 0.606 |
| 12/18/25 | 0.608 |
| 12/18/25 | 0.61 |
| 12/18/25 | 0.608 |
| 12/18/25 | 0.607 |
| 12/18/25 | 0.596 |
| 12/18/25 | 0.584 |
| 12/18/25 | 0.564 |
| 12/18/25 | 0.55 |
| 12/18/25 | 0.554 |
| 12/19/25 | 0.533 |
| 12/19/25 | 0.541 |
| 12/19/25 | 0.537 |
| 12/19/25 | 0.53 |
| 12/19/25 | 0.519 |
| 12/19/25 | 0.516 |
| 12/19/25 | 0.525 |
| 12/19/25 | 0.534 |
| 12/19/25 | 0.552 |
| 12/19/25 | 0.569 |
| 12/19/25 | 0.581 |
| 12/19/25 | 0.583 |
| 12/19/25 | 0.589 |
| 12/19/25 | 0.587 |
| 12/19/25 | 0.591 |
| 12/19/25 | 0.589 |
| 12/19/25 | 0.588 |
| 12/19/25 | 0.581 |
| 12/19/25 | 0.552 |
| 12/19/25 | 0.536 |
| 12/19/25 | 0.523 |
| 12/19/25 | 0.509 |
| 12/19/25 | 0.507 |
| 12/19/25 | 0.526 |
| 12/20/25 | 0.535 |
| 12/20/25 | 0.543 |
| 12/20/25 | 0.539 |
| 12/20/25 | 0.532 |
| 12/20/25 | 0.521 |
| 12/20/25 | 0.518 |
| 12/20/25 | 0.526 |
| 12/20/25 | 0.536 |
| 12/20/25 | 0.554 |
| 12/20/25 | 0.571 |
| 12/20/25 | 0.583 |
| 12/20/25 | 0.585 |
| 12/20/25 | 0.591 |
| 12/20/25 | 0.589 |
| 12/20/25 | 0.593 |
| 12/20/25 | 0.591 |
| 12/20/25 | 0.59 |
| 12/20/25 | 0.583 |
| 12/20/25 | 0.554 |
| 12/20/25 | 0.537 |
| 12/20/25 | 0.525 |
| 12/20/25 | 0.511 |
| 12/20/25 | 0.509 |
| 12/20/25 | 0.527 |
| 12/21/25 | 0.545 |
| 12/21/25 | 0.543 |
| 12/21/25 | 0.541 |
| 12/21/25 | 0.54 |
| 12/21/25 | 0.534 |
| 12/21/25 | 0.536 |
| 12/21/25 | 0.551 |
| 12/21/25 | 0.578 |
| 12/21/25 | 0.592 |
| 12/21/25 | 0.593 |
| 12/21/25 | 0.595 |
| 12/21/25 | 0.595 |
| 12/21/25 | 0.598 |
| 12/21/25 | 0.599 |
| 12/21/25 | 0.6 |
| 12/21/25 | 0.602 |
| 12/21/25 | 0.604 |
| 12/21/25 | 0.602 |
| 12/21/25 | 0.601 |
| 12/21/25 | 0.591 |
| 12/21/25 | 0.578 |
| 12/21/25 | 0.559 |
| 12/21/25 | 0.545 |
| 12/21/25 | 0.549 |
| 12/22/25 | 0.545 |
| 12/22/25 | 0.543 |
| 12/22/25 | 0.541 |
| 12/22/25 | 0.54 |
| 12/22/25 | 0.534 |
| 12/22/25 | 0.536 |
| 12/22/25 | 0.551 |
| 12/22/25 | 0.578 |
| 12/22/25 | 0.592 |
| 12/22/25 | 0.593 |
| 12/22/25 | 0.595 |
| 12/22/25 | 0.595 |
| 12/22/25 | 0.598 |
| 12/22/25 | 0.599 |
| 12/22/25 | 0.6 |
| 12/22/25 | 0.602 |
| 12/22/25 | 0.604 |
| 12/22/25 | 0.602 |
| 12/22/25 | 0.601 |
| 12/22/25 | 0.591 |
| 12/22/25 | 0.578 |
| 12/22/25 | 0.559 |
| 12/22/25 | 0.545 |
| 12/22/25 | 0.549 |
| 12/23/25 | 0.55 |
| 12/23/25 | 0.548 |
| 12/23/25 | 0.546 |
| 12/23/25 | 0.545 |
| 12/23/25 | 0.538 |
| 12/23/25 | 0.541 |
| 12/23/25 | 0.556 |
| 12/23/25 | 0.583 |
| 12/23/25 | 0.597 |
| 12/23/25 | 0.598 |
| 12/23/25 | 0.6 |
| 12/23/25 | 0.6 |
| 12/23/25 | 0.603 |
| 12/23/25 | 0.604 |
| 12/23/25 | 0.605 |
| 12/23/25 | 0.607 |
| 12/23/25 | 0.609 |
| 12/23/25 | 0.607 |
| 12/23/25 | 0.607 |
| 12/23/25 | 0.596 |
| 12/23/25 | 0.583 |
| 12/23/25 | 0.563 |
| 12/23/25 | 0.549 |
| 12/23/25 | 0.553 |
| 12/24/25 | 0.554 |
| 12/24/25 | 0.551 |
| 12/24/25 | 0.55 |
| 12/24/25 | 0.548 |
| 12/24/25 | 0.542 |
| 12/24/25 | 0.544 |
| 12/24/25 | 0.56 |
| 12/24/25 | 0.587 |
| 12/24/25 | 0.601 |
| 12/24/25 | 0.602 |
| 12/24/25 | 0.604 |
| 12/24/25 | 0.604 |
| 12/24/25 | 0.607 |
| 12/24/25 | 0.608 |
| 12/24/25 | 0.609 |
| 12/24/25 | 0.611 |
| 12/24/25 | 0.613 |
| 12/24/25 | 0.611 |
| 12/24/25 | 0.611 |
| 12/24/25 | 0.6 |
| 12/24/25 | 0.587 |
| 12/24/25 | 0.567 |
| 12/24/25 | 0.553 |
| 12/24/25 | 0.557 |
| 12/25/25 | 0.535 |
| 12/25/25 | 0.543 |
| 12/25/25 | 0.539 |
| 12/25/25 | 0.532 |
| 12/25/25 | 0.521 |
| 12/25/25 | 0.517 |
| 12/25/25 | 0.526 |
| 12/25/25 | 0.535 |
| 12/25/25 | 0.554 |
| 12/25/25 | 0.571 |
| 12/25/25 | 0.583 |
| 12/25/25 | 0.585 |
| 12/25/25 | 0.591 |
| 12/25/25 | 0.589 |
| 12/25/25 | 0.593 |
| 12/25/25 | 0.591 |
| 12/25/25 | 0.59 |
| 12/25/25 | 0.583 |
| 12/25/25 | 0.553 |
| 12/25/25 | 0.537 |
| 12/25/25 | 0.524 |
| 12/25/25 | 0.511 |
| 12/25/25 | 0.509 |
| 12/25/25 | 0.527 |
| 12/26/25 | 0.547 |
| 12/26/25 | 0.555 |
| 12/26/25 | 0.551 |
| 12/26/25 | 0.544 |
| 12/26/25 | 0.533 |
| 12/26/25 | 0.529 |
| 12/26/25 | 0.538 |
| 12/26/25 | 0.548 |
| 12/26/25 | 0.566 |
| 12/26/25 | 0.584 |
| 12/26/25 | 0.596 |
| 12/26/25 | 0.599 |
| 12/26/25 | 0.604 |
| 12/26/25 | 0.603 |
| 12/26/25 | 0.606 |
| 12/26/25 | 0.605 |
| 12/26/25 | 0.603 |
| 12/26/25 | 0.596 |
| 12/26/25 | 0.566 |
| 12/26/25 | 0.55 |
| 12/26/25 | 0.537 |
| 12/26/25 | 0.523 |
| 12/26/25 | 0.521 |
| 12/26/25 | 0.539 |
| 12/27/25 | 0.545 |
| 12/27/25 | 0.553 |
| 12/27/25 | 0.549 |
| 12/27/25 | 0.542 |
| 12/27/25 | 0.53 |
| 12/27/25 | 0.527 |
| 12/27/25 | 0.536 |
| 12/27/25 | 0.546 |
| 12/27/25 | 0.564 |
| 12/27/25 | 0.582 |
| 12/27/25 | 0.594 |
| 12/27/25 | 0.596 |
| 12/27/25 | 0.602 |
| 12/27/25 | 0.6 |
| 12/27/25 | 0.604 |
| 12/27/25 | 0.602 |
| 12/27/25 | 0.601 |
| 12/27/25 | 0.594 |
| 12/27/25 | 0.564 |
| 12/27/25 | 0.547 |
| 12/27/25 | 0.534 |
| 12/27/25 | 0.521 |
| 12/27/25 | 0.518 |
| 12/27/25 | 0.537 |
| 12/28/25 | 0.557 |
| 12/28/25 | 0.555 |
| 12/28/25 | 0.553 |
| 12/28/25 | 0.552 |
| 12/28/25 | 0.546 |
| 12/28/25 | 0.548 |
| 12/28/25 | 0.564 |
| 12/28/25 | 0.591 |
| 12/28/25 | 0.605 |
| 12/28/25 | 0.606 |
| 12/28/25 | 0.608 |
| 12/28/25 | 0.608 |
| 12/28/25 | 0.611 |
| 12/28/25 | 0.612 |
| 12/28/25 | 0.613 |
| 12/28/25 | 0.615 |
| 12/28/25 | 0.618 |
| 12/28/25 | 0.616 |
| 12/28/25 | 0.615 |
| 12/28/25 | 0.604 |
| 12/28/25 | 0.591 |
| 12/28/25 | 0.571 |
| 12/28/25 | 0.557 |
| 12/28/25 | 0.561 |
| 12/29/25 | 0.557 |
| 12/29/25 | 0.555 |
| 12/29/25 | 0.553 |
| 12/29/25 | 0.552 |
| 12/29/25 | 0.546 |
| 12/29/25 | 0.548 |
| 12/29/25 | 0.564 |
| 12/29/25 | 0.591 |
| 12/29/25 | 0.605 |
| 12/29/25 | 0.606 |
| 12/29/25 | 0.608 |
| 12/29/25 | 0.608 |
| 12/29/25 | 0.611 |
| 12/29/25 | 0.612 |
| 12/29/25 | 0.613 |
| 12/29/25 | 0.615 |
| 12/29/25 | 0.618 |
| 12/29/25 | 0.616 |
| 12/29/25 | 0.615 |
| 12/29/25 | 0.604 |
| 12/29/25 | 0.591 |
| 12/29/25 | 0.571 |
| 12/29/25 | 0.557 |
| 12/29/25 | 0.561 |
| 12/30/25 | 0.557 |
| 12/30/25 | 0.555 |
| 12/30/25 | 0.553 |
| 12/30/25 | 0.552 |
| 12/30/25 | 0.546 |
| 12/30/25 | 0.548 |
| 12/30/25 | 0.564 |
| 12/30/25 | 0.591 |
| 12/30/25 | 0.605 |
| 12/30/25 | 0.606 |
| 12/30/25 | 0.608 |
| 12/30/25 | 0.608 |
| 12/30/25 | 0.611 |
| 12/30/25 | 0.612 |
| 12/30/25 | 0.613 |
| 12/30/25 | 0.615 |
| 12/30/25 | 0.618 |
| 12/30/25 | 0.616 |
| 12/30/25 | 0.615 |
| 12/30/25 | 0.604 |
| 12/30/25 | 0.591 |
| 12/30/25 | 0.571 |
| 12/30/25 | 0.557 |
| 12/30/25 | 0.561 |
| 12/31/25 | 0.557 |
| 12/31/25 | 0.555 |
| 12/31/25 | 0.553 |
| 12/31/25 | 0.552 |
| 12/31/25 | 0.546 |
| 12/31/25 | 0.548 |
| 12/31/25 | 0.564 |
| 12/31/25 | 0.591 |
| 12/31/25 | 0.605 |
| 12/31/25 | 0.606 |
| 12/31/25 | 0.608 |
| 12/31/25 | 0.608 |
| 12/31/25 | 0.611 |
| 12/31/25 | 0.612 |
| 12/31/25 | 0.613 |
| 12/31/25 | 0.615 |
| 12/31/25 | 0.618 |
| 12/31/25 | 0.616 |
| 12/31/25 | 0.615 |
| 12/31/25 | 0.604 |
| 12/31/25 | 0.591 |
| 12/31/25 | 0.571 |
| 12/31/25 | 0.557 |
| 12/31/25 | 0.561 |
| 1/1/26 | 0.518 |
| 1/1/26 | 0.513 |
| 1/1/26 | 0.511 |
| 1/1/26 | 0.51 |
| 1/1/26 | 0.509 |
| 1/1/26 | 0.508 |
| 1/1/26 | 0.512 |
| 1/1/26 | 0.519 |
| 1/1/26 | 0.531 |
| 1/1/26 | 0.54 |
| 1/1/26 | 0.548 |
| 1/1/26 | 0.55 |
| 1/1/26 | 0.55 |
| 1/1/26 | 0.545 |
| 1/1/26 | 0.545 |
| 1/1/26 | 0.545 |
| 1/1/26 | 0.544 |
| 1/1/26 | 0.543 |
| 1/1/26 | 0.537 |
| 1/1/26 | 0.53 |
| 1/1/26 | 0.524 |
| 1/1/26 | 0.526 |
| 1/1/26 | 0.525 |
| 1/1/26 | 0.528 |
| 1/2/26 | 0.512 |
| 1/2/26 | 0.507 |
| 1/2/26 | 0.506 |
| 1/2/26 | 0.505 |
| 1/2/26 | 0.504 |
| 1/2/26 | 0.503 |
| 1/2/26 | 0.507 |
| 1/2/26 | 0.514 |
| 1/2/26 | 0.526 |
| 1/2/26 | 0.535 |
| 1/2/26 | 0.542 |
| 1/2/26 | 0.544 |
| 1/2/26 | 0.545 |
| 1/2/26 | 0.54 |
| 1/2/26 | 0.54 |
| 1/2/26 | 0.54 |
| 1/2/26 | 0.539 |
| 1/2/26 | 0.537 |
| 1/2/26 | 0.532 |
| 1/2/26 | 0.525 |
| 1/2/26 | 0.519 |
| 1/2/26 | 0.521 |
| 1/2/26 | 0.52 |
| 1/2/26 | 0.523 |
| 1/3/26 | 0.516 |
| 1/3/26 | 0.511 |
| 1/3/26 | 0.51 |
| 1/3/26 | 0.508 |
| 1/3/26 | 0.508 |
| 1/3/26 | 0.506 |
| 1/3/26 | 0.511 |
| 1/3/26 | 0.517 |
| 1/3/26 | 0.53 |
| 1/3/26 | 0.538 |
| 1/3/26 | 0.546 |
| 1/3/26 | 0.548 |
| 1/3/26 | 0.548 |
| 1/3/26 | 0.544 |
| 1/3/26 | 0.543 |
| 1/3/26 | 0.543 |
| 1/3/26 | 0.542 |
| 1/3/26 | 0.541 |
| 1/3/26 | 0.536 |
| 1/3/26 | 0.528 |
| 1/3/26 | 0.522 |
| 1/3/26 | 0.524 |
| 1/3/26 | 0.523 |
| 1/3/26 | 0.526 |
| 1/4/26 | 0.524 |
| 1/4/26 | 0.518 |
| 1/4/26 | 0.514 |
| 1/4/26 | 0.512 |
| 1/4/26 | 0.509 |
| 1/4/26 | 0.508 |
| 1/4/26 | 0.52 |
| 1/4/26 | 0.541 |
| 1/4/26 | 0.547 |
| 1/4/26 | 0.539 |
| 1/4/26 | 0.534 |
| 1/4/26 | 0.537 |
| 1/4/26 | 0.537 |
| 1/4/26 | 0.536 |
| 1/4/26 | 0.541 |
| 1/4/26 | 0.545 |
| 1/4/26 | 0.545 |
| 1/4/26 | 0.543 |
| 1/4/26 | 0.541 |
| 1/4/26 | 0.537 |
| 1/4/26 | 0.531 |
| 1/4/26 | 0.531 |
| 1/4/26 | 0.528 |
| 1/4/26 | 0.532 |
| 1/5/26 | 0.522 |
| 1/5/26 | 0.516 |
| 1/5/26 | 0.512 |
| 1/5/26 | 0.51 |
| 1/5/26 | 0.507 |
| 1/5/26 | 0.506 |
| 1/5/26 | 0.518 |
| 1/5/26 | 0.539 |
| 1/5/26 | 0.545 |
| 1/5/26 | 0.537 |
| 1/5/26 | 0.532 |
| 1/5/26 | 0.535 |
| 1/5/26 | 0.535 |
| 1/5/26 | 0.534 |
| 1/5/26 | 0.539 |
| 1/5/26 | 0.543 |
| 1/5/26 | 0.543 |
| 1/5/26 | 0.541 |
| 1/5/26 | 0.538 |
| 1/5/26 | 0.535 |
| 1/5/26 | 0.528 |
| 1/5/26 | 0.529 |
| 1/5/26 | 0.526 |
| 1/5/26 | 0.53 |
| 1/6/26 | 0.523 |
| 1/6/26 | 0.516 |
| 1/6/26 | 0.512 |
| 1/6/26 | 0.51 |
| 1/6/26 | 0.508 |
| 1/6/26 | 0.506 |
| 1/6/26 | 0.519 |
| 1/6/26 | 0.539 |
| 1/6/26 | 0.545 |
| 1/6/26 | 0.537 |
| 1/6/26 | 0.532 |
| 1/6/26 | 0.536 |
| 1/6/26 | 0.535 |
| 1/6/26 | 0.534 |
| 1/6/26 | 0.539 |
| 1/6/26 | 0.543 |
| 1/6/26 | 0.543 |
| 1/6/26 | 0.541 |
| 1/6/26 | 0.539 |
| 1/6/26 | 0.535 |
| 1/6/26 | 0.529 |
| 1/6/26 | 0.53 |
| 1/6/26 | 0.526 |
| 1/6/26 | 0.53 |
| 1/7/26 | 0.525 |
| 1/7/26 | 0.519 |
| 1/7/26 | 0.515 |
| 1/7/26 | 0.513 |
| 1/7/26 | 0.51 |
| 1/7/26 | 0.508 |
| 1/7/26 | 0.521 |
| 1/7/26 | 0.542 |
| 1/7/26 | 0.548 |
| 1/7/26 | 0.54 |
| 1/7/26 | 0.535 |
| 1/7/26 | 0.538 |
| 1/7/26 | 0.538 |
| 1/7/26 | 0.537 |
| 1/7/26 | 0.542 |
| 1/7/26 | 0.546 |
| 1/7/26 | 0.546 |
| 1/7/26 | 0.544 |
| 1/7/26 | 0.541 |
| 1/7/26 | 0.538 |
| 1/7/26 | 0.531 |
| 1/7/26 | 0.532 |
| 1/7/26 | 0.529 |
| 1/7/26 | 0.533 |
| 1/8/26 | 0.527 |
| 1/8/26 | 0.521 |
| 1/8/26 | 0.517 |
| 1/8/26 | 0.515 |
| 1/8/26 | 0.512 |
| 1/8/26 | 0.511 |
| 1/8/26 | 0.523 |
| 1/8/26 | 0.544 |
| 1/8/26 | 0.55 |
| 1/8/26 | 0.542 |
| 1/8/26 | 0.537 |
| 1/8/26 | 0.541 |
| 1/8/26 | 0.54 |
| 1/8/26 | 0.539 |
| 1/8/26 | 0.544 |
| 1/8/26 | 0.548 |
| 1/8/26 | 0.548 |
| 1/8/26 | 0.546 |
| 1/8/26 | 0.544 |
| 1/8/26 | 0.54 |
| 1/8/26 | 0.534 |
| 1/8/26 | 0.534 |
| 1/8/26 | 0.531 |
| 1/8/26 | 0.535 |
| 1/9/26 | 0.514 |
| 1/9/26 | 0.509 |
| 1/9/26 | 0.508 |
| 1/9/26 | 0.507 |
| 1/9/26 | 0.506 |
| 1/9/26 | 0.505 |
| 1/9/26 | 0.509 |
| 1/9/26 | 0.516 |
| 1/9/26 | 0.528 |
| 1/9/26 | 0.537 |
| 1/9/26 | 0.544 |
| 1/9/26 | 0.546 |
| 1/9/26 | 0.547 |
| 1/9/26 | 0.542 |
| 1/9/26 | 0.542 |
| 1/9/26 | 0.541 |
| 1/9/26 | 0.54 |
| 1/9/26 | 0.539 |
| 1/9/26 | 0.534 |
| 1/9/26 | 0.527 |
| 1/9/26 | 0.52 |
| 1/9/26 | 0.523 |
| 1/9/26 | 0.521 |
| 1/9/26 | 0.525 |
| 1/10/26 | 0.519 |
| 1/10/26 | 0.514 |
| 1/10/26 | 0.513 |
| 1/10/26 | 0.511 |
| 1/10/26 | 0.511 |
| 1/10/26 | 0.509 |
| 1/10/26 | 0.514 |
| 1/10/26 | 0.521 |
| 1/10/26 | 0.533 |
| 1/10/26 | 0.542 |
| 1/10/26 | 0.549 |
| 1/10/26 | 0.552 |
| 1/10/26 | 0.552 |
| 1/10/26 | 0.547 |
| 1/10/26 | 0.547 |
| 1/10/26 | 0.547 |
| 1/10/26 | 0.546 |
| 1/10/26 | 0.544 |
| 1/10/26 | 0.539 |
| 1/10/26 | 0.532 |
| 1/10/26 | 0.525 |
| 1/10/26 | 0.528 |
| 1/10/26 | 0.526 |
| 1/10/26 | 0.53 |
| 1/11/26 | 0.526 |
| 1/11/26 | 0.52 |
| 1/11/26 | 0.516 |
| 1/11/26 | 0.514 |
| 1/11/26 | 0.511 |
| 1/11/26 | 0.509 |
| 1/11/26 | 0.522 |
| 1/11/26 | 0.543 |
| 1/11/26 | 0.549 |
| 1/11/26 | 0.541 |
| 1/11/26 | 0.536 |
| 1/11/26 | 0.539 |
| 1/11/26 | 0.539 |
| 1/11/26 | 0.538 |
| 1/11/26 | 0.543 |
| 1/11/26 | 0.547 |
| 1/11/26 | 0.547 |
| 1/11/26 | 0.545 |
| 1/11/26 | 0.543 |
| 1/11/26 | 0.539 |
| 1/11/26 | 0.532 |
| 1/11/26 | 0.533 |
| 1/11/26 | 0.53 |
| 1/11/26 | 0.534 |
| 1/12/26 | 0.523 |
| 1/12/26 | 0.517 |
| 1/12/26 | 0.513 |
| 1/12/26 | 0.511 |
| 1/12/26 | 0.508 |
| 1/12/26 | 0.507 |
| 1/12/26 | 0.519 |
| 1/12/26 | 0.54 |
| 1/12/26 | 0.546 |
| 1/12/26 | 0.538 |
| 1/12/26 | 0.533 |
| 1/12/26 | 0.536 |
| 1/12/26 | 0.536 |
| 1/12/26 | 0.535 |
| 1/12/26 | 0.54 |
| 1/12/26 | 0.544 |
| 1/12/26 | 0.544 |
| 1/12/26 | 0.542 |
| 1/12/26 | 0.54 |
| 1/12/26 | 0.536 |
| 1/12/26 | 0.529 |
| 1/12/26 | 0.53 |
| 1/12/26 | 0.527 |
| 1/12/26 | 0.531 |
| 1/13/26 | 0.522 |
| 1/13/26 | 0.516 |
| 1/13/26 | 0.512 |
| 1/13/26 | 0.51 |
| 1/13/26 | 0.507 |
| 1/13/26 | 0.506 |
| 1/13/26 | 0.518 |
| 1/13/26 | 0.539 |
| 1/13/26 | 0.545 |
| 1/13/26 | 0.537 |
| 1/13/26 | 0.532 |
| 1/13/26 | 0.535 |
| 1/13/26 | 0.535 |
| 1/13/26 | 0.534 |
| 1/13/26 | 0.539 |
| 1/13/26 | 0.543 |
| 1/13/26 | 0.543 |
| 1/13/26 | 0.541 |
| 1/13/26 | 0.539 |
| 1/13/26 | 0.535 |
| 1/13/26 | 0.529 |
| 1/13/26 | 0.529 |
| 1/13/26 | 0.526 |
| 1/13/26 | 0.53 |
| 1/14/26 | 0.523 |
| 1/14/26 | 0.516 |
| 1/14/26 | 0.512 |
| 1/14/26 | 0.511 |
| 1/14/26 | 0.508 |
| 1/14/26 | 0.506 |
| 1/14/26 | 0.519 |
| 1/14/26 | 0.539 |
| 1/14/26 | 0.545 |
| 1/14/26 | 0.537 |
| 1/14/26 | 0.532 |
| 1/14/26 | 0.536 |
| 1/14/26 | 0.535 |
| 1/14/26 | 0.534 |
| 1/14/26 | 0.539 |
| 1/14/26 | 0.543 |
| 1/14/26 | 0.543 |
| 1/14/26 | 0.541 |
| 1/14/26 | 0.539 |
| 1/14/26 | 0.535 |
| 1/14/26 | 0.529 |
| 1/14/26 | 0.53 |
| 1/14/26 | 0.526 |
| 1/14/26 | 0.53 |
| 1/15/26 | 0.517 |
| 1/15/26 | 0.51 |
| 1/15/26 | 0.507 |
| 1/15/26 | 0.505 |
| 1/15/26 | 0.502 |
| 1/15/26 | 0.5 |
| 1/15/26 | 0.513 |
| 1/15/26 | 0.533 |
| 1/15/26 | 0.539 |
| 1/15/26 | 0.531 |
| 1/15/26 | 0.526 |
| 1/15/26 | 0.53 |
| 1/15/26 | 0.529 |
| 1/15/26 | 0.529 |
| 1/15/26 | 0.533 |
| 1/15/26 | 0.537 |
| 1/15/26 | 0.537 |
| 1/15/26 | 0.535 |
| 1/15/26 | 0.533 |
| 1/15/26 | 0.529 |
| 1/15/26 | 0.523 |
| 1/15/26 | 0.524 |
| 1/15/26 | 0.52 |
| 1/15/26 | 0.524 |
| 1/16/26 | 0.51 |
| 1/16/26 | 0.505 |
| 1/16/26 | 0.504 |
| 1/16/26 | 0.502 |
| 1/16/26 | 0.502 |
| 1/16/26 | 0.501 |
| 1/16/26 | 0.505 |
| 1/16/26 | 0.512 |
| 1/16/26 | 0.524 |
| 1/16/26 | 0.532 |
| 1/16/26 | 0.54 |
| 1/16/26 | 0.542 |
| 1/16/26 | 0.542 |
| 1/16/26 | 0.537 |
| 1/16/26 | 0.537 |
| 1/16/26 | 0.537 |
| 1/16/26 | 0.536 |
| 1/16/26 | 0.535 |
| 1/16/26 | 0.529 |
| 1/16/26 | 0.522 |
| 1/16/26 | 0.516 |
| 1/16/26 | 0.518 |
| 1/16/26 | 0.517 |
| 1/16/26 | 0.52 |
| 1/17/26 | 0.512 |
| 1/17/26 | 0.507 |
| 1/17/26 | 0.506 |
| 1/17/26 | 0.504 |
| 1/17/26 | 0.504 |
| 1/17/26 | 0.502 |
| 1/17/26 | 0.507 |
| 1/17/26 | 0.513 |
| 1/17/26 | 0.525 |
| 1/17/26 | 0.534 |
| 1/17/26 | 0.542 |
| 1/17/26 | 0.544 |
| 1/17/26 | 0.544 |
| 1/17/26 | 0.539 |
| 1/17/26 | 0.539 |
| 1/17/26 | 0.539 |
| 1/17/26 | 0.538 |
| 1/17/26 | 0.537 |
| 1/17/26 | 0.531 |
| 1/17/26 | 0.524 |
| 1/17/26 | 0.518 |
| 1/17/26 | 0.52 |
| 1/17/26 | 0.519 |
| 1/17/26 | 0.522 |
| 1/18/26 | 0.52 |
| 1/18/26 | 0.513 |
| 1/18/26 | 0.509 |
| 1/18/26 | 0.507 |
| 1/18/26 | 0.505 |
| 1/18/26 | 0.503 |
| 1/18/26 | 0.515 |
| 1/18/26 | 0.536 |
| 1/18/26 | 0.542 |
| 1/18/26 | 0.534 |
| 1/18/26 | 0.529 |
| 1/18/26 | 0.532 |
| 1/18/26 | 0.532 |
| 1/18/26 | 0.531 |
| 1/18/26 | 0.536 |
| 1/18/26 | 0.54 |
| 1/18/26 | 0.54 |
| 1/18/26 | 0.538 |
| 1/18/26 | 0.536 |
| 1/18/26 | 0.532 |
| 1/18/26 | 0.526 |
| 1/18/26 | 0.527 |
| 1/18/26 | 0.523 |
| 1/18/26 | 0.527 |
| 1/19/26 | 0.526 |
| 1/19/26 | 0.52 |
| 1/19/26 | 0.516 |
| 1/19/26 | 0.514 |
| 1/19/26 | 0.511 |
| 1/19/26 | 0.509 |
| 1/19/26 | 0.522 |
| 1/19/26 | 0.543 |
| 1/19/26 | 0.549 |
| 1/19/26 | 0.541 |
| 1/19/26 | 0.536 |
| 1/19/26 | 0.539 |
| 1/19/26 | 0.539 |
| 1/19/26 | 0.538 |
| 1/19/26 | 0.543 |
| 1/19/26 | 0.547 |
| 1/19/26 | 0.547 |
| 1/19/26 | 0.545 |
| 1/19/26 | 0.543 |
| 1/19/26 | 0.539 |
| 1/19/26 | 0.532 |
| 1/19/26 | 0.533 |
| 1/19/26 | 0.53 |
| 1/19/26 | 0.534 |
| 1/20/26 | 0.53 |
| 1/20/26 | 0.523 |
| 1/20/26 | 0.52 |
| 1/20/26 | 0.518 |
| 1/20/26 | 0.515 |
| 1/20/26 | 0.513 |
| 1/20/26 | 0.526 |
| 1/20/26 | 0.547 |
| 1/20/26 | 0.553 |
| 1/20/26 | 0.545 |
| 1/20/26 | 0.54 |
| 1/20/26 | 0.543 |
| 1/20/26 | 0.543 |
| 1/20/26 | 0.542 |
| 1/20/26 | 0.547 |
| 1/20/26 | 0.551 |
| 1/20/26 | 0.551 |
| 1/20/26 | 0.549 |
| 1/20/26 | 0.547 |
| 1/20/26 | 0.543 |
| 1/20/26 | 0.536 |
| 1/20/26 | 0.537 |
| 1/20/26 | 0.534 |
| 1/20/26 | 0.538 |
| 1/21/26 | 0.531 |
| 1/21/26 | 0.524 |
| 1/21/26 | 0.52 |
| 1/21/26 | 0.519 |
| 1/21/26 | 0.516 |
| 1/21/26 | 0.514 |
| 1/21/26 | 0.527 |
| 1/21/26 | 0.548 |
| 1/21/26 | 0.554 |
| 1/21/26 | 0.546 |
| 1/21/26 | 0.541 |
| 1/21/26 | 0.544 |
| 1/21/26 | 0.544 |
| 1/21/26 | 0.543 |
| 1/21/26 | 0.548 |
| 1/21/26 | 0.552 |
| 1/21/26 | 0.552 |
| 1/21/26 | 0.55 |
| 1/21/26 | 0.547 |
| 1/21/26 | 0.543 |
| 1/21/26 | 0.537 |
| 1/21/26 | 0.538 |
| 1/21/26 | 0.535 |
| 1/21/26 | 0.539 |
| 1/22/26 | 0.53 |
| 1/22/26 | 0.523 |
| 1/22/26 | 0.52 |
| 1/22/26 | 0.518 |
| 1/22/26 | 0.515 |
| 1/22/26 | 0.513 |
| 1/22/26 | 0.526 |
| 1/22/26 | 0.547 |
| 1/22/26 | 0.553 |
| 1/22/26 | 0.545 |
| 1/22/26 | 0.54 |
| 1/22/26 | 0.543 |
| 1/22/26 | 0.543 |
| 1/22/26 | 0.542 |
| 1/22/26 | 0.547 |
| 1/22/26 | 0.551 |
| 1/22/26 | 0.551 |
| 1/22/26 | 0.549 |
| 1/22/26 | 0.546 |
| 1/22/26 | 0.542 |
| 1/22/26 | 0.536 |
| 1/22/26 | 0.537 |
| 1/22/26 | 0.534 |
| 1/22/26 | 0.538 |
| 1/23/26 | 0.524 |
| 1/23/26 | 0.519 |
| 1/23/26 | 0.517 |
| 1/23/26 | 0.516 |
| 1/23/26 | 0.515 |
| 1/23/26 | 0.514 |
| 1/23/26 | 0.518 |
| 1/23/26 | 0.525 |
| 1/23/26 | 0.538 |
| 1/23/26 | 0.547 |
| 1/23/26 | 0.554 |
| 1/23/26 | 0.556 |
| 1/23/26 | 0.557 |
| 1/23/26 | 0.552 |
| 1/23/26 | 0.552 |
| 1/23/26 | 0.551 |
| 1/23/26 | 0.55 |
| 1/23/26 | 0.549 |
| 1/23/26 | 0.544 |
| 1/23/26 | 0.536 |
| 1/23/26 | 0.53 |
| 1/23/26 | 0.532 |
| 1/23/26 | 0.531 |
| 1/23/26 | 0.534 |
| 1/24/26 | 0.517 |
| 1/24/26 | 0.512 |
| 1/24/26 | 0.511 |
| 1/24/26 | 0.509 |
| 1/24/26 | 0.509 |
| 1/24/26 | 0.508 |
| 1/24/26 | 0.512 |
| 1/24/26 | 0.519 |
| 1/24/26 | 0.531 |
| 1/24/26 | 0.54 |
| 1/24/26 | 0.547 |
| 1/24/26 | 0.549 |
| 1/24/26 | 0.55 |
| 1/24/26 | 0.545 |
| 1/24/26 | 0.545 |
| 1/24/26 | 0.544 |
| 1/24/26 | 0.543 |
| 1/24/26 | 0.542 |
| 1/24/26 | 0.537 |
| 1/24/26 | 0.53 |
| 1/24/26 | 0.523 |
| 1/24/26 | 0.526 |
| 1/24/26 | 0.524 |
| 1/24/26 | 0.528 |
| 1/25/26 | 0.523 |
| 1/25/26 | 0.516 |
| 1/25/26 | 0.513 |
| 1/25/26 | 0.511 |
| 1/25/26 | 0.508 |
| 1/25/26 | 0.506 |
| 1/25/26 | 0.519 |
| 1/25/26 | 0.539 |
| 1/25/26 | 0.545 |
| 1/25/26 | 0.537 |
| 1/25/26 | 0.533 |
| 1/25/26 | 0.536 |
| 1/25/26 | 0.536 |
| 1/25/26 | 0.535 |
| 1/25/26 | 0.54 |
| 1/25/26 | 0.543 |
| 1/25/26 | 0.543 |
| 1/25/26 | 0.542 |
| 1/25/26 | 0.539 |
| 1/25/26 | 0.535 |
| 1/25/26 | 0.529 |
| 1/25/26 | 0.53 |
| 1/25/26 | 0.527 |
| 1/25/26 | 0.531 |
| 1/26/26 | 0.528 |
| 1/26/26 | 0.521 |
| 1/26/26 | 0.517 |
| 1/26/26 | 0.515 |
| 1/26/26 | 0.513 |
| 1/26/26 | 0.511 |
| 1/26/26 | 0.524 |
| 1/26/26 | 0.544 |
| 1/26/26 | 0.55 |
| 1/26/26 | 0.542 |
| 1/26/26 | 0.537 |
| 1/26/26 | 0.541 |
| 1/26/26 | 0.54 |
| 1/26/26 | 0.54 |
| 1/26/26 | 0.544 |
| 1/26/26 | 0.548 |
| 1/26/26 | 0.548 |
| 1/26/26 | 0.547 |
| 1/26/26 | 0.544 |
| 1/26/26 | 0.54 |
| 1/26/26 | 0.534 |
| 1/26/26 | 0.535 |
| 1/26/26 | 0.531 |
| 1/26/26 | 0.535 |
| 1/27/26 | 0.53 |
| 1/27/26 | 0.523 |
| 1/27/26 | 0.519 |
| 1/27/26 | 0.518 |
| 1/27/26 | 0.515 |
| 1/27/26 | 0.513 |
| 1/27/26 | 0.526 |
| 1/27/26 | 0.547 |
| 1/27/26 | 0.553 |
| 1/27/26 | 0.545 |
| 1/27/26 | 0.54 |
| 1/27/26 | 0.543 |
| 1/27/26 | 0.543 |
| 1/27/26 | 0.542 |
| 1/27/26 | 0.547 |
| 1/27/26 | 0.551 |
| 1/27/26 | 0.551 |
| 1/27/26 | 0.549 |
| 1/27/26 | 0.546 |
| 1/27/26 | 0.542 |
| 1/27/26 | 0.536 |
| 1/27/26 | 0.537 |
| 1/27/26 | 0.534 |
| 1/27/26 | 0.538 |
| 1/28/26 | 0.516 |
| 1/28/26 | 0.509 |
| 1/28/26 | 0.504 |
| 1/28/26 | 0.504 |
| 1/28/26 | 0.501 |
| 1/28/26 | 0.505 |
| 1/28/26 | 0.535 |
| 1/28/26 | 0.573 |
| 1/28/26 | 0.581 |
| 1/28/26 | 0.572 |
| 1/28/26 | 0.572 |
| 1/28/26 | 0.575 |
| 1/28/26 | 0.575 |
| 1/28/26 | 0.576 |
| 1/28/26 | 0.579 |
| 1/28/26 | 0.58 |
| 1/28/26 | 0.58 |
| 1/28/26 | 0.577 |
| 1/28/26 | 0.566 |
| 1/28/26 | 0.565 |
| 1/28/26 | 0.548 |
| 1/28/26 | 0.546 |
| 1/28/26 | 0.535 |
| 1/28/26 | 0.541 |
| 1/29/26 | 0.516 |
| 1/29/26 | 0.509 |
| 1/29/26 | 0.504 |
| 1/29/26 | 0.504 |
| 1/29/26 | 0.5 |
| 1/29/26 | 0.505 |
| 1/29/26 | 0.535 |
| 1/29/26 | 0.573 |
| 1/29/26 | 0.58 |
| 1/29/26 | 0.572 |
| 1/29/26 | 0.572 |
| 1/29/26 | 0.575 |
| 1/29/26 | 0.575 |
| 1/29/26 | 0.576 |
| 1/29/26 | 0.579 |
| 1/29/26 | 0.58 |
| 1/29/26 | 0.58 |
| 1/29/26 | 0.577 |
| 1/29/26 | 0.566 |
| 1/29/26 | 0.565 |
| 1/29/26 | 0.547 |
| 1/29/26 | 0.545 |
| 1/29/26 | 0.535 |
| 1/29/26 | 0.541 |
| 1/30/26 | 0.503 |
| 1/30/26 | 0.5 |
| 1/30/26 | 0.495 |
| 1/30/26 | 0.492 |
| 1/30/26 | 0.489 |
| 1/30/26 | 0.492 |
| 1/30/26 | 0.499 |
| 1/30/26 | 0.518 |
| 1/30/26 | 0.54 |
| 1/30/26 | 0.555 |
| 1/30/26 | 0.561 |
| 1/30/26 | 0.566 |
| 1/30/26 | 0.566 |
| 1/30/26 | 0.565 |
| 1/30/26 | 0.559 |
| 1/30/26 | 0.554 |
| 1/30/26 | 0.548 |
| 1/30/26 | 0.548 |
| 1/30/26 | 0.536 |
| 1/30/26 | 0.534 |
| 1/30/26 | 0.516 |
| 1/30/26 | 0.506 |
| 1/30/26 | 0.498 |
| 1/30/26 | 0.504 |
| 1/31/26 | 0.497 |
| 1/31/26 | 0.494 |
| 1/31/26 | 0.49 |
| 1/31/26 | 0.486 |
| 1/31/26 | 0.484 |
| 1/31/26 | 0.486 |
| 1/31/26 | 0.493 |
| 1/31/26 | 0.512 |
| 1/31/26 | 0.534 |
| 1/31/26 | 0.549 |
| 1/31/26 | 0.554 |
| 1/31/26 | 0.56 |
| 1/31/26 | 0.56 |
| 1/31/26 | 0.559 |
| 1/31/26 | 0.553 |
| 1/31/26 | 0.548 |
| 1/31/26 | 0.542 |
| 1/31/26 | 0.542 |
| 1/31/26 | 0.53 |
| 1/31/26 | 0.528 |
| 1/31/26 | 0.511 |
| 1/31/26 | 0.501 |
| 1/31/26 | 0.493 |
| 1/31/26 | 0.498 |
| 2/1/26 | 0.502 |
| 2/1/26 | 0.495 |
| 2/1/26 | 0.49 |
| 2/1/26 | 0.49 |
| 2/1/26 | 0.487 |
| 2/1/26 | 0.491 |
| 2/1/26 | 0.52 |
| 2/1/26 | 0.557 |
| 2/1/26 | 0.564 |
| 2/1/26 | 0.556 |
| 2/1/26 | 0.556 |
| 2/1/26 | 0.559 |
| 2/1/26 | 0.559 |
| 2/1/26 | 0.56 |
| 2/1/26 | 0.563 |
| 2/1/26 | 0.564 |
| 2/1/26 | 0.564 |
| 2/1/26 | 0.561 |
| 2/1/26 | 0.55 |
| 2/1/26 | 0.549 |
| 2/1/26 | 0.532 |
| 2/1/26 | 0.53 |
| 2/1/26 | 0.52 |
| 2/1/26 | 0.526 |
| 2/2/26 | 0.501 |
| 2/2/26 | 0.494 |
| 2/2/26 | 0.489 |
| 2/2/26 | 0.489 |
| 2/2/26 | 0.486 |
| 2/2/26 | 0.49 |
| 2/2/26 | 0.519 |
| 2/2/26 | 0.556 |
| 2/2/26 | 0.564 |
| 2/2/26 | 0.555 |
| 2/2/26 | 0.555 |
| 2/2/26 | 0.558 |
| 2/2/26 | 0.558 |
| 2/2/26 | 0.559 |
| 2/2/26 | 0.562 |
| 2/2/26 | 0.563 |
| 2/2/26 | 0.563 |
| 2/2/26 | 0.56 |
| 2/2/26 | 0.55 |
| 2/2/26 | 0.548 |
| 2/2/26 | 0.531 |
| 2/2/26 | 0.53 |
| 2/2/26 | 0.52 |
| 2/2/26 | 0.525 |
| 2/3/26 | 0.509 |
| 2/3/26 | 0.502 |
| 2/3/26 | 0.497 |
| 2/3/26 | 0.497 |
| 2/3/26 | 0.494 |
| 2/3/26 | 0.498 |
| 2/3/26 | 0.528 |
| 2/3/26 | 0.565 |
| 2/3/26 | 0.573 |
| 2/3/26 | 0.565 |
| 2/3/26 | 0.564 |
| 2/3/26 | 0.567 |
| 2/3/26 | 0.568 |
| 2/3/26 | 0.569 |
| 2/3/26 | 0.571 |
| 2/3/26 | 0.572 |
| 2/3/26 | 0.572 |
| 2/3/26 | 0.569 |
| 2/3/26 | 0.559 |
| 2/3/26 | 0.558 |
| 2/3/26 | 0.54 |
| 2/3/26 | 0.538 |
| 2/3/26 | 0.528 |
| 2/3/26 | 0.534 |
| 2/4/26 | 0.51 |
| 2/4/26 | 0.503 |
| 2/4/26 | 0.498 |
| 2/4/26 | 0.498 |
| 2/4/26 | 0.495 |
| 2/4/26 | 0.499 |
| 2/4/26 | 0.529 |
| 2/4/26 | 0.566 |
| 2/4/26 | 0.574 |
| 2/4/26 | 0.566 |
| 2/4/26 | 0.565 |
| 2/4/26 | 0.568 |
| 2/4/26 | 0.569 |
| 2/4/26 | 0.57 |
| 2/4/26 | 0.572 |
| 2/4/26 | 0.573 |
| 2/4/26 | 0.573 |
| 2/4/26 | 0.57 |
| 2/4/26 | 0.56 |
| 2/4/26 | 0.558 |
| 2/4/26 | 0.541 |
| 2/4/26 | 0.539 |
| 2/4/26 | 0.529 |
| 2/4/26 | 0.534 |
| 2/5/26 | 0.516 |
| 2/5/26 | 0.509 |
| 2/5/26 | 0.504 |
| 2/5/26 | 0.504 |
| 2/5/26 | 0.5 |
| 2/5/26 | 0.505 |
| 2/5/26 | 0.535 |
| 2/5/26 | 0.573 |
| 2/5/26 | 0.58 |
| 2/5/26 | 0.572 |
| 2/5/26 | 0.571 |
| 2/5/26 | 0.574 |
| 2/5/26 | 0.575 |
| 2/5/26 | 0.576 |
| 2/5/26 | 0.579 |
| 2/5/26 | 0.58 |
| 2/5/26 | 0.58 |
| 2/5/26 | 0.576 |
| 2/5/26 | 0.566 |
| 2/5/26 | 0.565 |
| 2/5/26 | 0.547 |
| 2/5/26 | 0.545 |
| 2/5/26 | 0.535 |
| 2/5/26 | 0.54 |
| 2/6/26 | 0.505 |
| 2/6/26 | 0.502 |
| 2/6/26 | 0.497 |
| 2/6/26 | 0.493 |
| 2/6/26 | 0.491 |
| 2/6/26 | 0.494 |
| 2/6/26 | 0.5 |
| 2/6/26 | 0.519 |
| 2/6/26 | 0.542 |
| 2/6/26 | 0.557 |
| 2/6/26 | 0.562 |
| 2/6/26 | 0.568 |
| 2/6/26 | 0.568 |
| 2/6/26 | 0.567 |
| 2/6/26 | 0.561 |
| 2/6/26 | 0.556 |
| 2/6/26 | 0.55 |
| 2/6/26 | 0.549 |
| 2/6/26 | 0.537 |
| 2/6/26 | 0.536 |
| 2/6/26 | 0.518 |
| 2/6/26 | 0.508 |
| 2/6/26 | 0.5 |
| 2/6/26 | 0.506 |
| 2/7/26 | 0.499 |
| 2/7/26 | 0.496 |
| 2/7/26 | 0.491 |
| 2/7/26 | 0.488 |
| 2/7/26 | 0.485 |
| 2/7/26 | 0.488 |
| 2/7/26 | 0.495 |
| 2/7/26 | 0.513 |
| 2/7/26 | 0.536 |
| 2/7/26 | 0.551 |
| 2/7/26 | 0.556 |
| 2/7/26 | 0.561 |
| 2/7/26 | 0.562 |
| 2/7/26 | 0.561 |
| 2/7/26 | 0.554 |
| 2/7/26 | 0.55 |
| 2/7/26 | 0.544 |
| 2/7/26 | 0.543 |
| 2/7/26 | 0.531 |
| 2/7/26 | 0.53 |
| 2/7/26 | 0.512 |
| 2/7/26 | 0.502 |
| 2/7/26 | 0.494 |
| 2/7/26 | 0.5 |
| 2/8/26 | 0.51 |
| 2/8/26 | 0.503 |
| 2/8/26 | 0.498 |
| 2/8/26 | 0.498 |
| 2/8/26 | 0.495 |
| 2/8/26 | 0.499 |
| 2/8/26 | 0.529 |
| 2/8/26 | 0.566 |
| 2/8/26 | 0.574 |
| 2/8/26 | 0.566 |
| 2/8/26 | 0.565 |
| 2/8/26 | 0.568 |
| 2/8/26 | 0.568 |
| 2/8/26 | 0.569 |
| 2/8/26 | 0.572 |
| 2/8/26 | 0.573 |
| 2/8/26 | 0.573 |
| 2/8/26 | 0.57 |
| 2/8/26 | 0.559 |
| 2/8/26 | 0.558 |
| 2/8/26 | 0.541 |
| 2/8/26 | 0.539 |
| 2/8/26 | 0.529 |
| 2/8/26 | 0.534 |
| 2/8/26 | 0.518 |
| 2/9/26 | 0.51 |
| 2/9/26 | 0.505 |
| 2/9/26 | 0.506 |
| 2/9/26 | 0.502 |
| 2/9/26 | 0.506 |
| 2/9/26 | 0.537 |
| 2/9/26 | 0.575 |
| 2/9/26 | 0.582 |
| 2/9/26 | 0.574 |
| 2/9/26 | 0.573 |
| 2/9/26 | 0.576 |
| 2/9/26 | 0.577 |
| 2/9/26 | 0.578 |
| 2/9/26 | 0.581 |
| 2/9/26 | 0.582 |
| 2/9/26 | 0.582 |
| 2/9/26 | 0.578 |
| 2/9/26 | 0.568 |
| 2/9/26 | 0.567 |
| 2/9/26 | 0.549 |
| 2/9/26 | 0.547 |
| 2/9/26 | 0.537 |
| 2/9/26 | 0.542 |
| 2/9/26 | 0.518 |
| 2/10/26 | 0.511 |
| 2/10/26 | 0.506 |
| 2/10/26 | 0.506 |
| 2/10/26 | 0.503 |
| 2/10/26 | 0.507 |
| 2/10/26 | 0.538 |
| 2/10/26 | 0.576 |
| 2/10/26 | 0.583 |
| 2/10/26 | 0.575 |
| 2/10/26 | 0.574 |
| 2/10/26 | 0.577 |
| 2/10/26 | 0.578 |
| 2/10/26 | 0.579 |
| 2/10/26 | 0.582 |
| 2/10/26 | 0.583 |
| 2/10/26 | 0.583 |
| 2/10/26 | 0.579 |
| 2/10/26 | 0.569 |
| 2/10/26 | 0.568 |
| 2/10/26 | 0.55 |
| 2/10/26 | 0.548 |
| 2/10/26 | 0.538 |
| 2/10/26 | 0.543 |
| 2/10/26 | 0.514 |
| 2/11/26 | 0.507 |
| 2/11/26 | 0.502 |
| 2/11/26 | 0.502 |
| 2/11/26 | 0.499 |
| 2/11/26 | 0.503 |
| 2/11/26 | 0.533 |
| 2/11/26 | 0.571 |
| 2/11/26 | 0.579 |
| 2/11/26 | 0.57 |
| 2/11/26 | 0.57 |
| 2/11/26 | 0.573 |
| 2/11/26 | 0.573 |
| 2/11/26 | 0.574 |
| 2/11/26 | 0.577 |
| 2/11/26 | 0.578 |
| 2/11/26 | 0.578 |
| 2/11/26 | 0.575 |
| 2/11/26 | 0.564 |
| 2/11/26 | 0.563 |
| 2/11/26 | 0.546 |
| 2/11/26 | 0.544 |
| 2/11/26 | 0.533 |
| 2/11/26 | 0.539 |
| 2/11/26 | 0.516 |
| 2/12/26 | 0.509 |
| 2/12/26 | 0.504 |
| 2/12/26 | 0.504 |
| 2/12/26 | 0.5 |
| 2/12/26 | 0.505 |
| 2/12/26 | 0.535 |
| 2/12/26 | 0.573 |
| 2/12/26 | 0.58 |
| 2/12/26 | 0.572 |
| 2/12/26 | 0.571 |
| 2/12/26 | 0.575 |
| 2/12/26 | 0.575 |
| 2/12/26 | 0.576 |
| 2/12/26 | 0.579 |
| 2/12/26 | 0.58 |
| 2/12/26 | 0.58 |
| 2/12/26 | 0.577 |
| 2/12/26 | 0.566 |
| 2/12/26 | 0.565 |
| 2/12/26 | 0.547 |
| 2/12/26 | 0.545 |
| 2/12/26 | 0.535 |
| 2/12/26 | 0.541 |
| 2/12/26 | 0.507 |
| 2/13/26 | 0.504 |
| 2/13/26 | 0.5 |
| 2/13/26 | 0.496 |
| 2/13/26 | 0.493 |
| 2/13/26 | 0.496 |
| 2/13/26 | 0.503 |
| 2/13/26 | 0.522 |
| 2/13/26 | 0.545 |
| 2/13/26 | 0.56 |
| 2/13/26 | 0.565 |
| 2/13/26 | 0.571 |
| 2/13/26 | 0.571 |
| 2/13/26 | 0.57 |
| 2/13/26 | 0.563 |
| 2/13/26 | 0.559 |
| 2/13/26 | 0.553 |
| 2/13/26 | 0.552 |
| 2/13/26 | 0.54 |
| 2/13/26 | 0.538 |
| 2/13/26 | 0.521 |
| 2/13/26 | 0.51 |
| 2/13/26 | 0.503 |
| 2/13/26 | 0.508 |
| 2/13/26 | 0.506 |
| 2/14/26 | 0.503 |
| 2/14/26 | 0.498 |
| 2/14/26 | 0.495 |
| 2/14/26 | 0.492 |
| 2/14/26 | 0.495 |
| 2/14/26 | 0.501 |
| 2/14/26 | 0.521 |
| 2/14/26 | 0.543 |
| 2/14/26 | 0.558 |
| 2/14/26 | 0.564 |
| 2/14/26 | 0.569 |
| 2/14/26 | 0.57 |
| 2/14/26 | 0.569 |
| 2/14/26 | 0.562 |
| 2/14/26 | 0.557 |
| 2/14/26 | 0.551 |
| 2/14/26 | 0.551 |
| 2/14/26 | 0.539 |
| 2/14/26 | 0.537 |
| 2/14/26 | 0.519 |
| 2/14/26 | 0.509 |
| 2/14/26 | 0.501 |
| 2/14/26 | 0.507 |
| 2/14/26 | 0.513 |
| 2/15/26 | 0.506 |
| 2/15/26 | 0.501 |
| 2/15/26 | 0.501 |
| 2/15/26 | 0.498 |
| 2/15/26 | 0.502 |
| 2/15/26 | 0.532 |
| 2/15/26 | 0.569 |
| 2/15/26 | 0.577 |
| 2/15/26 | 0.569 |
| 2/15/26 | 0.568 |
| 2/15/26 | 0.571 |
| 2/15/26 | 0.572 |
| 2/15/26 | 0.573 |
| 2/15/26 | 0.575 |
| 2/15/26 | 0.577 |
| 2/15/26 | 0.576 |
| 2/15/26 | 0.573 |
| 2/15/26 | 0.563 |
| 2/15/26 | 0.562 |
| 2/15/26 | 0.544 |
| 2/15/26 | 0.542 |
| 2/15/26 | 0.532 |
| 2/15/26 | 0.537 |
| 2/15/26 | 0.511 |
| 2/16/26 | 0.504 |
| 2/16/26 | 0.499 |
| 2/16/26 | 0.499 |
| 2/16/26 | 0.496 |
| 2/16/26 | 0.5 |
| 2/16/26 | 0.53 |
| 2/16/26 | 0.568 |
| 2/16/26 | 0.575 |
| 2/16/26 | 0.567 |
| 2/16/26 | 0.566 |
| 2/16/26 | 0.569 |
| 2/16/26 | 0.57 |
| 2/16/26 | 0.571 |
| 2/16/26 | 0.574 |
| 2/16/26 | 0.575 |
| 2/16/26 | 0.575 |
| 2/16/26 | 0.571 |
| 2/16/26 | 0.561 |
| 2/16/26 | 0.56 |
| 2/16/26 | 0.542 |
| 2/16/26 | 0.541 |
| 2/16/26 | 0.53 |
| 2/16/26 | 0.536 |
| 2/16/26 | 0.513 |
| 2/17/26 | 0.506 |
| 2/17/26 | 0.501 |
| 2/17/26 | 0.501 |
| 2/17/26 | 0.498 |
| 2/17/26 | 0.502 |
| 2/17/26 | 0.532 |
| 2/17/26 | 0.569 |
| 2/17/26 | 0.577 |
| 2/17/26 | 0.569 |
| 2/17/26 | 0.568 |
| 2/17/26 | 0.571 |
| 2/17/26 | 0.572 |
| 2/17/26 | 0.573 |
| 2/17/26 | 0.575 |
| 2/17/26 | 0.577 |
| 2/17/26 | 0.576 |
| 2/17/26 | 0.573 |
| 2/17/26 | 0.563 |
| 2/17/26 | 0.562 |
| 2/17/26 | 0.544 |
| 2/17/26 | 0.542 |
| 2/17/26 | 0.532 |
| 2/17/26 | 0.537 |
| 2/17/26 | 0.511 |
| 2/18/26 | 0.504 |
| 2/18/26 | 0.499 |
| 2/18/26 | 0.5 |
| 2/18/26 | 0.496 |
| 2/18/26 | 0.5 |
| 2/18/26 | 0.53 |
| 2/18/26 | 0.568 |
| 2/18/26 | 0.575 |
| 2/18/26 | 0.567 |
| 2/18/26 | 0.567 |
| 2/18/26 | 0.57 |
| 2/18/26 | 0.57 |
| 2/18/26 | 0.571 |
| 2/18/26 | 0.574 |
| 2/18/26 | 0.575 |
| 2/18/26 | 0.575 |
| 2/18/26 | 0.572 |
| 2/18/26 | 0.561 |
| 2/18/26 | 0.56 |
| 2/18/26 | 0.543 |
| 2/18/26 | 0.541 |
| 2/18/26 | 0.531 |
| 2/18/26 | 0.536 |
| 2/18/26 | 0.507 |
| 2/19/26 | 0.5 |
| 2/19/26 | 0.495 |
| 2/19/26 | 0.495 |
| 2/19/26 | 0.492 |
| 2/19/26 | 0.496 |
| 2/19/26 | 0.526 |
| 2/19/26 | 0.563 |
| 2/19/26 | 0.57 |
| 2/19/26 | 0.562 |
| 2/19/26 | 0.562 |
| 2/19/26 | 0.565 |
| 2/19/26 | 0.565 |
| 2/19/26 | 0.566 |
| 2/19/26 | 0.569 |
| 2/19/26 | 0.57 |
| 2/19/26 | 0.57 |
| 2/19/26 | 0.567 |
| 2/19/26 | 0.556 |
| 2/19/26 | 0.555 |
| 2/19/26 | 0.538 |
| 2/19/26 | 0.536 |
| 2/19/26 | 0.526 |
| 2/19/26 | 0.531 |
| 2/19/26 | 0.491 |
| 2/20/26 | 0.488 |
| 2/20/26 | 0.484 |
| 2/20/26 | 0.48 |
| 2/20/26 | 0.477 |
| 2/20/26 | 0.48 |
| 2/20/26 | 0.487 |
| 2/20/26 | 0.505 |
| 2/20/26 | 0.527 |
| 2/20/26 | 0.542 |
| 2/20/26 | 0.547 |
| 2/20/26 | 0.552 |
| 2/20/26 | 0.553 |
| 2/20/26 | 0.552 |
| 2/20/26 | 0.545 |
| 2/20/26 | 0.541 |
| 2/20/26 | 0.535 |
| 2/20/26 | 0.534 |
| 2/20/26 | 0.523 |
| 2/20/26 | 0.521 |
| 2/20/26 | 0.504 |
| 2/20/26 | 0.494 |
| 2/20/26 | 0.486 |
| 2/20/26 | 0.492 |
| 2/20/26 | 0.491 |
| 2/21/26 | 0.488 |
| 2/21/26 | 0.483 |
| 2/21/26 | 0.48 |
| 2/21/26 | 0.477 |
| 2/21/26 | 0.48 |
| 2/21/26 | 0.486 |
| 2/21/26 | 0.505 |
| 2/21/26 | 0.527 |
| 2/21/26 | 0.541 |
| 2/21/26 | 0.547 |
| 2/21/26 | 0.552 |
| 2/21/26 | 0.552 |
| 2/21/26 | 0.551 |
| 2/21/26 | 0.545 |
| 2/21/26 | 0.54 |
| 2/21/26 | 0.535 |
| 2/21/26 | 0.534 |
| 2/21/26 | 0.522 |
| 2/21/26 | 0.521 |
| 2/21/26 | 0.504 |
| 2/21/26 | 0.494 |
| 2/21/26 | 0.486 |
| 2/21/26 | 0.491 |
| 2/21/26 | 0.497 |
| 2/22/26 | 0.49 |
| 2/22/26 | 0.485 |
| 2/22/26 | 0.485 |
| 2/22/26 | 0.482 |
| 2/22/26 | 0.486 |
| 2/22/26 | 0.515 |
| 2/22/26 | 0.551 |
| 2/22/26 | 0.559 |
| 2/22/26 | 0.551 |
| 2/22/26 | 0.55 |
| 2/22/26 | 0.553 |
| 2/22/26 | 0.554 |
| 2/22/26 | 0.555 |
| 2/22/26 | 0.557 |
| 2/22/26 | 0.558 |
| 2/22/26 | 0.558 |
| 2/22/26 | 0.555 |
| 2/22/26 | 0.545 |
| 2/22/26 | 0.544 |
| 2/22/26 | 0.527 |
| 2/22/26 | 0.525 |
| 2/22/26 | 0.515 |
| 2/22/26 | 0.52 |
| 2/22/26 | 0.498 |
| 2/23/26 | 0.491 |
| 2/23/26 | 0.486 |
| 2/23/26 | 0.486 |
| 2/23/26 | 0.483 |
| 2/23/26 | 0.487 |
| 2/23/26 | 0.516 |
| 2/23/26 | 0.553 |
| 2/23/26 | 0.56 |
| 2/23/26 | 0.552 |
| 2/23/26 | 0.552 |
| 2/23/26 | 0.554 |
| 2/23/26 | 0.555 |
| 2/23/26 | 0.556 |
| 2/23/26 | 0.559 |
| 2/23/26 | 0.56 |
| 2/23/26 | 0.559 |
| 2/23/26 | 0.556 |
| 2/23/26 | 0.546 |
| 2/23/26 | 0.545 |
| 2/23/26 | 0.528 |
| 2/23/26 | 0.526 |
| 2/23/26 | 0.516 |
| 2/23/26 | 0.522 |
| 2/23/26 | 0.495 |
| 2/24/26 | 0.488 |
| 2/24/26 | 0.483 |
| 2/24/26 | 0.483 |
| 2/24/26 | 0.48 |
| 2/24/26 | 0.484 |
| 2/24/26 | 0.513 |
| 2/24/26 | 0.549 |
| 2/24/26 | 0.557 |
| 2/24/26 | 0.549 |
| 2/24/26 | 0.548 |
| 2/24/26 | 0.551 |
| 2/24/26 | 0.551 |
| 2/24/26 | 0.552 |
| 2/24/26 | 0.555 |
| 2/24/26 | 0.556 |
| 2/24/26 | 0.556 |
| 2/24/26 | 0.553 |
| 2/24/26 | 0.543 |
| 2/24/26 | 0.542 |
| 2/24/26 | 0.525 |
| 2/24/26 | 0.523 |
| 2/24/26 | 0.513 |
| 2/24/26 | 0.518 |
| 2/24/26 | 0.485 |
| 2/25/26 | 0.474 |
| 2/25/26 | 0.473 |
| 2/25/26 | 0.483 |
| 2/25/26 | 0.491 |
| 2/25/26 | 0.51 |
| 2/25/26 | 0.549 |
| 2/25/26 | 0.587 |
| 2/25/26 | 0.584 |
| 2/25/26 | 0.575 |
| 2/25/26 | 0.568 |
| 2/25/26 | 0.565 |
| 2/25/26 | 0.565 |
| 2/25/26 | 0.564 |
| 2/25/26 | 0.562 |
| 2/25/26 | 0.561 |
| 2/25/26 | 0.561 |
| 2/25/26 | 0.564 |
| 2/25/26 | 0.562 |
| 2/25/26 | 0.555 |
| 2/25/26 | 0.544 |
| 2/25/26 | 0.524 |
| 2/25/26 | 0.513 |
| 2/25/26 | 0.505 |
| 2/25/26 | 0.489 |
| 2/26/26 | 0.477 |
| 2/26/26 | 0.477 |
| 2/26/26 | 0.487 |
| 2/26/26 | 0.495 |
| 2/26/26 | 0.514 |
| 2/26/26 | 0.553 |
| 2/26/26 | 0.592 |
| 2/26/26 | 0.589 |
| 2/26/26 | 0.579 |
| 2/26/26 | 0.572 |
| 2/26/26 | 0.569 |
| 2/26/26 | 0.569 |
| 2/26/26 | 0.568 |
| 2/26/26 | 0.566 |
| 2/26/26 | 0.565 |
| 2/26/26 | 0.565 |
| 2/26/26 | 0.568 |
| 2/26/26 | 0.566 |
| 2/26/26 | 0.559 |
| 2/26/26 | 0.548 |
| 2/26/26 | 0.528 |
| 2/26/26 | 0.517 |
| 2/26/26 | 0.508 |
| 2/26/26 | 0.463 |
| 2/27/26 | 0.46 |
| 2/27/26 | 0.465 |
| 2/27/26 | 0.472 |
| 2/27/26 | 0.477 |
| 2/27/26 | 0.492 |
| 2/27/26 | 0.512 |
| 2/27/26 | 0.545 |
| 2/27/26 | 0.561 |
| 2/27/26 | 0.565 |
| 2/27/26 | 0.562 |
| 2/27/26 | 0.555 |
| 2/27/26 | 0.555 |
| 2/27/26 | 0.558 |
| 2/27/26 | 0.541 |
| 2/27/26 | 0.525 |
| 2/27/26 | 0.524 |
| 2/27/26 | 0.531 |
| 2/27/26 | 0.533 |
| 2/27/26 | 0.534 |
| 2/27/26 | 0.524 |
| 2/27/26 | 0.502 |
| 2/27/26 | 0.503 |
| 2/27/26 | 0.501 |
| 2/27/26 | 0.461 |
| 2/28/26 | 0.459 |
| 2/28/26 | 0.463 |
| 2/28/26 | 0.47 |
| 2/28/26 | 0.475 |
| 2/28/26 | 0.491 |
| 2/28/26 | 0.51 |
| 2/28/26 | 0.543 |
| 2/28/26 | 0.559 |
| 2/28/26 | 0.563 |
| 2/28/26 | 0.56 |
| 2/28/26 | 0.553 |
| 2/28/26 | 0.553 |
| 2/28/26 | 0.556 |
| 2/28/26 | 0.539 |
| 2/28/26 | 0.523 |
| 2/28/26 | 0.522 |
| 2/28/26 | 0.529 |
| 2/28/26 | 0.531 |
| 2/28/26 | 0.532 |
| 2/28/26 | 0.522 |
| 2/28/26 | 0.5 |
| 2/28/26 | 0.501 |
| 2/28/26 | 0.499 |
| 2/28/26 | 0.486 |
| 3/1/26 | 0.475 |
| 3/1/26 | 0.474 |
| 3/1/26 | 0.484 |
| 3/1/26 | 0.491 |
| 3/1/26 | 0.511 |
| 3/1/26 | 0.55 |
| 3/1/26 | 0.588 |
| 3/1/26 | 0.585 |
| 3/1/26 | 0.575 |
| 3/1/26 | 0.569 |
| 3/1/26 | 0.565 |
| 3/1/26 | 0.565 |
| 3/1/26 | 0.564 |
| 3/1/26 | 0.562 |
| 3/1/26 | 0.562 |
| 3/1/26 | 0.562 |
| 3/1/26 | 0.565 |
| 3/1/26 | 0.562 |
| 3/1/26 | 0.555 |
| 3/1/26 | 0.544 |
| 3/1/26 | 0.524 |
| 3/1/26 | 0.514 |
| 3/1/26 | 0.505 |
| 3/1/26 | 0.481 |
| 3/2/26 | 0.47 |
| 3/2/26 | 0.469 |
| 3/2/26 | 0.479 |
| 3/2/26 | 0.487 |
| 3/2/26 | 0.506 |
| 3/2/26 | 0.545 |
| 3/2/26 | 0.582 |
| 3/2/26 | 0.579 |
| 3/2/26 | 0.57 |
| 3/2/26 | 0.563 |
| 3/2/26 | 0.56 |
| 3/2/26 | 0.56 |
| 3/2/26 | 0.559 |
| 3/2/26 | 0.557 |
| 3/2/26 | 0.556 |
| 3/2/26 | 0.556 |
| 3/2/26 | 0.559 |
| 3/2/26 | 0.557 |
| 3/2/26 | 0.55 |
| 3/2/26 | 0.539 |
| 3/2/26 | 0.519 |
| 3/2/26 | 0.509 |
| 3/2/26 | 0.5 |
| 3/2/26 | 0.476 |
| 3/3/26 | 0.465 |
| 3/3/26 | 0.465 |
| 3/3/26 | 0.474 |
| 3/3/26 | 0.482 |
| 3/3/26 | 0.501 |
| 3/3/26 | 0.539 |
| 3/3/26 | 0.576 |
| 3/3/26 | 0.573 |
| 3/3/26 | 0.564 |
| 3/3/26 | 0.558 |
| 3/3/26 | 0.554 |
| 3/3/26 | 0.554 |
| 3/3/26 | 0.553 |
| 3/3/26 | 0.551 |
| 3/3/26 | 0.551 |
| 3/3/26 | 0.551 |
| 3/3/26 | 0.554 |
| 3/3/26 | 0.551 |
| 3/3/26 | 0.544 |
| 3/3/26 | 0.534 |
| 3/3/26 | 0.514 |
| 3/3/26 | 0.504 |
| 3/3/26 | 0.495 |
| 3/3/26 | 0.475 |
| 3/4/26 | 0.464 |
| 3/4/26 | 0.464 |
| 3/4/26 | 0.473 |
| 3/4/26 | 0.481 |
| 3/4/26 | 0.5 |
| 3/4/26 | 0.538 |
| 3/4/26 | 0.575 |
| 3/4/26 | 0.572 |
| 3/4/26 | 0.563 |
| 3/4/26 | 0.557 |
| 3/4/26 | 0.553 |
| 3/4/26 | 0.553 |
| 3/4/26 | 0.552 |
| 3/4/26 | 0.55 |
| 3/4/26 | 0.55 |
| 3/4/26 | 0.55 |
| 3/4/26 | 0.553 |
| 3/4/26 | 0.55 |
| 3/4/26 | 0.543 |
| 3/4/26 | 0.533 |
| 3/4/26 | 0.513 |
| 3/4/26 | 0.503 |
| 3/4/26 | 0.494 |
| 3/4/26 | 0.475 |
| 3/5/26 | 0.464 |
| 3/5/26 | 0.464 |
| 3/5/26 | 0.473 |
| 3/5/26 | 0.481 |
| 3/5/26 | 0.5 |
| 3/5/26 | 0.538 |
| 3/5/26 | 0.575 |
| 3/5/26 | 0.572 |
| 3/5/26 | 0.563 |
| 3/5/26 | 0.557 |
| 3/5/26 | 0.553 |
| 3/5/26 | 0.553 |
| 3/5/26 | 0.552 |
| 3/5/26 | 0.55 |
| 3/5/26 | 0.55 |
| 3/5/26 | 0.55 |
| 3/5/26 | 0.553 |
| 3/5/26 | 0.55 |
| 3/5/26 | 0.543 |
| 3/5/26 | 0.533 |
| 3/5/26 | 0.513 |
| 3/5/26 | 0.503 |
| 3/5/26 | 0.494 |
| 3/5/26 | 0.446 |
| 3/6/26 | 0.443 |
| 3/6/26 | 0.448 |
| 3/6/26 | 0.455 |
| 3/6/26 | 0.46 |
| 3/6/26 | 0.474 |
| 3/6/26 | 0.493 |
| 3/6/26 | 0.525 |
| 3/6/26 | 0.541 |
| 3/6/26 | 0.545 |
| 3/6/26 | 0.541 |
| 3/6/26 | 0.535 |
| 3/6/26 | 0.535 |
| 3/6/26 | 0.537 |
| 3/6/26 | 0.521 |
| 3/6/26 | 0.506 |
| 3/6/26 | 0.504 |
| 3/6/26 | 0.512 |
| 3/6/26 | 0.513 |
| 3/6/26 | 0.514 |
| 3/6/26 | 0.505 |
| 3/6/26 | 0.483 |
| 3/6/26 | 0.484 |
| 3/6/26 | 0.483 |
| 3/6/26 | 0.447 |
| 3/7/26 | 0.444 |
| 3/7/26 | 0.449 |
| 3/7/26 | 0.456 |
| 3/7/26 | 0.461 |
| 3/7/26 | 0.475 |
| 3/7/26 | 0.494 |
| 3/7/26 | 0.526 |
| 3/7/26 | 0.542 |
| 3/7/26 | 0.546 |
| 3/7/26 | 0.543 |
| 3/7/26 | 0.536 |
| 3/7/26 | 0.536 |
| 3/7/26 | 0.539 |
| 3/7/26 | 0.522 |
| 3/7/26 | 0.507 |
| 3/7/26 | 0.506 |
| 3/7/26 | 0.513 |
| 3/7/26 | 0.514 |
| 3/7/26 | 0.516 |
| 3/7/26 | 0.506 |
| 3/7/26 | 0.484 |
| 3/7/26 | 0.486 |
| 3/7/26 | 0.484 |
| 3/7/26 | 0.477 |
| 3/8/26 | 0.466 |
| 3/8/26 | 0.466 |
| 3/8/26 | 0.475 |
| 3/8/26 | 0.483 |
| 3/8/26 | 0.502 |
| 3/8/26 | 0.54 |
| 3/8/26 | 0.578 |
| 3/8/26 | 0.575 |
| 3/8/26 | 0.565 |
| 3/8/26 | 0.559 |
| 3/8/26 | 0.555 |
| 3/8/26 | 0.555 |
| 3/8/26 | 0.555 |
| 3/8/26 | 0.553 |
| 3/8/26 | 0.552 |
| 3/8/26 | 0.552 |
| 3/8/26 | 0.555 |
| 3/8/26 | 0.553 |
| 3/8/26 | 0.546 |
| 3/8/26 | 0.535 |
| 3/8/26 | 0.515 |
| 3/8/26 | 0.505 |
| 3/8/26 | 0.497 |
| 3/8/26 | 0.477 |
| 3/9/26 | 0.466 |
| 3/9/26 | 0.466 |
| 3/9/26 | 0.475 |
| 3/9/26 | 0.483 |
| 3/9/26 | 0.502 |
| 3/9/26 | 0.54 |
| 3/9/26 | 0.578 |
| 3/9/26 | 0.575 |
| 3/9/26 | 0.565 |
| 3/9/26 | 0.559 |
| 3/9/26 | 0.555 |
| 3/9/26 | 0.555 |
| 3/9/26 | 0.555 |
| 3/9/26 | 0.553 |
| 3/9/26 | 0.552 |
| 3/9/26 | 0.552 |
| 3/9/26 | 0.555 |
| 3/9/26 | 0.553 |
| 3/9/26 | 0.546 |
| 3/9/26 | 0.535 |
| 3/9/26 | 0.515 |
| 3/9/26 | 0.505 |
| 3/9/26 | 0.497 |
| 3/9/26 | 0.475 |
| 3/10/26 | 0.464 |
| 3/10/26 | 0.463 |
| 3/10/26 | 0.473 |
| 3/10/26 | 0.48 |
| 3/10/26 | 0.499 |
| 3/10/26 | 0.538 |
| 3/10/26 | 0.575 |
| 3/10/26 | 0.572 |
| 3/10/26 | 0.562 |
| 3/10/26 | 0.556 |
| 3/10/26 | 0.552 |
| 3/10/26 | 0.553 |
| 3/10/26 | 0.552 |
| 3/10/26 | 0.55 |
| 3/10/26 | 0.549 |
| 3/10/26 | 0.549 |
| 3/10/26 | 0.552 |
| 3/10/26 | 0.55 |
| 3/10/26 | 0.543 |
| 3/10/26 | 0.532 |
| 3/10/26 | 0.513 |
| 3/10/26 | 0.502 |
| 3/10/26 | 0.494 |
| 3/10/26 | 0.468 |
| 3/11/26 | 0.457 |
| 3/11/26 | 0.456 |
| 3/11/26 | 0.466 |
| 3/11/26 | 0.473 |
| 3/11/26 | 0.492 |
| 3/11/26 | 0.529 |
| 3/11/26 | 0.566 |
| 3/11/26 | 0.563 |
| 3/11/26 | 0.554 |
| 3/11/26 | 0.548 |
| 3/11/26 | 0.544 |
| 3/11/26 | 0.544 |
| 3/11/26 | 0.543 |
| 3/11/26 | 0.541 |
| 3/11/26 | 0.541 |
| 3/11/26 | 0.541 |
| 3/11/26 | 0.544 |
| 3/11/26 | 0.541 |
| 3/11/26 | 0.534 |
| 3/11/26 | 0.524 |
| 3/11/26 | 0.505 |
| 3/11/26 | 0.495 |
| 3/11/26 | 0.486 |
| 3/11/26 | 0.463 |
| 3/12/26 | 0.452 |
| 3/12/26 | 0.452 |
| 3/12/26 | 0.461 |
| 3/12/26 | 0.469 |
| 3/12/26 | 0.487 |
| 3/12/26 | 0.524 |
| 3/12/26 | 0.561 |
| 3/12/26 | 0.558 |
| 3/12/26 | 0.548 |
| 3/12/26 | 0.542 |
| 3/12/26 | 0.539 |
| 3/12/26 | 0.539 |
| 3/12/26 | 0.538 |
| 3/12/26 | 0.536 |
| 3/12/26 | 0.536 |
| 3/12/26 | 0.536 |
| 3/12/26 | 0.538 |
| 3/12/26 | 0.536 |
| 3/12/26 | 0.529 |
| 3/12/26 | 0.519 |
| 3/12/26 | 0.5 |
| 3/12/26 | 0.49 |
| 3/12/26 | 0.482 |
| 3/12/26 | 0.434 |
| 3/13/26 | 0.431 |
| 3/13/26 | 0.436 |
| 3/13/26 | 0.442 |
| 3/13/26 | 0.447 |
| 3/13/26 | 0.461 |
| 3/13/26 | 0.479 |
| 3/13/26 | 0.51 |
| 3/13/26 | 0.526 |
| 3/13/26 | 0.53 |
| 3/13/26 | 0.527 |
| 3/13/26 | 0.52 |
| 3/13/26 | 0.52 |
| 3/13/26 | 0.523 |
| 3/13/26 | 0.507 |
| 3/13/26 | 0.492 |
| 3/13/26 | 0.491 |
| 3/13/26 | 0.498 |
| 3/13/26 | 0.499 |
| 3/13/26 | 0.5 |
| 3/13/26 | 0.491 |
| 3/13/26 | 0.47 |
| 3/13/26 | 0.471 |
| 3/13/26 | 0.47 |
| 3/13/26 | 0.436 |
| 3/14/26 | 0.433 |
| 3/14/26 | 0.438 |
| 3/14/26 | 0.444 |
| 3/14/26 | 0.449 |
| 3/14/26 | 0.463 |
| 3/14/26 | 0.481 |
| 3/14/26 | 0.513 |
| 3/14/26 | 0.528 |
| 3/14/26 | 0.532 |
| 3/14/26 | 0.529 |
| 3/14/26 | 0.523 |
| 3/14/26 | 0.523 |
| 3/14/26 | 0.525 |
| 3/14/26 | 0.509 |
| 3/14/26 | 0.494 |
| 3/14/26 | 0.493 |
| 3/14/26 | 0.5 |
| 3/14/26 | 0.501 |
| 3/14/26 | 0.502 |
| 3/14/26 | 0.493 |
| 3/14/26 | 0.472 |
| 3/14/26 | 0.473 |
| 3/14/26 | 0.472 |
| 3/14/26 | 0.47 |
| 3/15/26 | 0.46 |
| 3/15/26 | 0.459 |
| 3/15/26 | 0.468 |
| 3/15/26 | 0.476 |
| 3/15/26 | 0.495 |
| 3/15/26 | 0.533 |
| 3/15/26 | 0.569 |
| 3/15/26 | 0.566 |
| 3/15/26 | 0.557 |
| 3/15/26 | 0.551 |
| 3/15/26 | 0.547 |
| 3/15/26 | 0.547 |
| 3/15/26 | 0.547 |
| 3/15/26 | 0.545 |
| 3/15/26 | 0.544 |
| 3/15/26 | 0.544 |
| 3/15/26 | 0.547 |
| 3/15/26 | 0.545 |
| 3/15/26 | 0.538 |
| 3/15/26 | 0.527 |
| 3/15/26 | 0.508 |
| 3/15/26 | 0.498 |
| 3/15/26 | 0.489 |
| 3/15/26 | 0.471 |
| 3/16/26 | 0.46 |
| 3/16/26 | 0.46 |
| 3/16/26 | 0.469 |
| 3/16/26 | 0.477 |
| 3/16/26 | 0.495 |
| 3/16/26 | 0.533 |
| 3/16/26 | 0.57 |
| 3/16/26 | 0.567 |
| 3/16/26 | 0.558 |
| 3/16/26 | 0.552 |
| 3/16/26 | 0.548 |
| 3/16/26 | 0.548 |
| 3/16/26 | 0.547 |
| 3/16/26 | 0.545 |
| 3/16/26 | 0.545 |
| 3/16/26 | 0.545 |
| 3/16/26 | 0.548 |
| 3/16/26 | 0.545 |
| 3/16/26 | 0.538 |
| 3/16/26 | 0.528 |
| 3/16/26 | 0.509 |
| 3/16/26 | 0.498 |
| 3/16/26 | 0.49 |
| 3/16/26 | 0.471 |
| 3/17/26 | 0.46 |
| 3/17/26 | 0.46 |
| 3/17/26 | 0.469 |
| 3/17/26 | 0.477 |
| 3/17/26 | 0.495 |
| 3/17/26 | 0.533 |
| 3/17/26 | 0.57 |
| 3/17/26 | 0.567 |
| 3/17/26 | 0.558 |
| 3/17/26 | 0.552 |
| 3/17/26 | 0.548 |
| 3/17/26 | 0.548 |
| 3/17/26 | 0.547 |
| 3/17/26 | 0.545 |
| 3/17/26 | 0.545 |
| 3/17/26 | 0.545 |
| 3/17/26 | 0.548 |
| 3/17/26 | 0.546 |
| 3/17/26 | 0.539 |
| 3/17/26 | 0.528 |
| 3/17/26 | 0.509 |
| 3/17/26 | 0.498 |
| 3/17/26 | 0.49 |
| 3/17/26 | 0.471 |
| 3/18/26 | 0.46 |
| 3/18/26 | 0.459 |
| 3/18/26 | 0.469 |
| 3/18/26 | 0.476 |
| 3/18/26 | 0.495 |
| 3/18/26 | 0.533 |
| 3/18/26 | 0.57 |
| 3/18/26 | 0.567 |
| 3/18/26 | 0.557 |
| 3/18/26 | 0.551 |
| 3/18/26 | 0.547 |
| 3/18/26 | 0.548 |
| 3/18/26 | 0.547 |
| 3/18/26 | 0.545 |
| 3/18/26 | 0.544 |
| 3/18/26 | 0.544 |
| 3/18/26 | 0.547 |
| 3/18/26 | 0.545 |
| 3/18/26 | 0.538 |
| 3/18/26 | 0.527 |
| 3/18/26 | 0.508 |
| 3/18/26 | 0.498 |
| 3/18/26 | 0.49 |
| 3/18/26 | 0.467 |
| 3/19/26 | 0.457 |
| 3/19/26 | 0.456 |
| 3/19/26 | 0.465 |
| 3/19/26 | 0.473 |
| 3/19/26 | 0.492 |
| 3/19/26 | 0.529 |
| 3/19/26 | 0.566 |
| 3/19/26 | 0.563 |
| 3/19/26 | 0.554 |
| 3/19/26 | 0.547 |
| 3/19/26 | 0.544 |
| 3/19/26 | 0.544 |
| 3/19/26 | 0.543 |
| 3/19/26 | 0.541 |
| 3/19/26 | 0.541 |
| 3/19/26 | 0.541 |
| 3/19/26 | 0.543 |
| 3/19/26 | 0.541 |
| 3/19/26 | 0.534 |
| 3/19/26 | 0.524 |
| 3/19/26 | 0.505 |
| 3/19/26 | 0.494 |
| 3/19/26 | 0.486 |
| 3/19/26 | 0.436 |
| 3/20/26 | 0.433 |
| 3/20/26 | 0.438 |
| 3/20/26 | 0.444 |
| 3/20/26 | 0.449 |
| 3/20/26 | 0.463 |
| 3/20/26 | 0.481 |
| 3/20/26 | 0.513 |
| 3/20/26 | 0.528 |
| 3/20/26 | 0.532 |
| 3/20/26 | 0.529 |
| 3/20/26 | 0.523 |
| 3/20/26 | 0.522 |
| 3/20/26 | 0.525 |
| 3/20/26 | 0.509 |
| 3/20/26 | 0.494 |
| 3/20/26 | 0.493 |
| 3/20/26 | 0.5 |
| 3/20/26 | 0.501 |
| 3/20/26 | 0.502 |
| 3/20/26 | 0.493 |
| 3/20/26 | 0.472 |
| 3/20/26 | 0.473 |
| 3/20/26 | 0.472 |
| 3/20/26 | 0.437 |
| 3/21/26 | 0.434 |
| 3/21/26 | 0.439 |
| 3/21/26 | 0.445 |
| 3/21/26 | 0.45 |
| 3/21/26 | 0.465 |
| 3/21/26 | 0.483 |
| 3/21/26 | 0.514 |
| 3/21/26 | 0.53 |
| 3/21/26 | 0.533 |
| 3/21/26 | 0.53 |
| 3/21/26 | 0.524 |
| 3/21/26 | 0.524 |
| 3/21/26 | 0.526 |
| 3/21/26 | 0.511 |
| 3/21/26 | 0.496 |
| 3/21/26 | 0.494 |
| 3/21/26 | 0.501 |
| 3/21/26 | 0.503 |
| 3/21/26 | 0.504 |
| 3/21/26 | 0.494 |
| 3/21/26 | 0.473 |
| 3/21/26 | 0.474 |
| 3/21/26 | 0.473 |
| 3/21/26 | 0.467 |
| 3/22/26 | 0.456 |
| 3/22/26 | 0.455 |
| 3/22/26 | 0.465 |
| 3/22/26 | 0.472 |
| 3/22/26 | 0.491 |
| 3/22/26 | 0.528 |
| 3/22/26 | 0.565 |
| 3/22/26 | 0.562 |
| 3/22/26 | 0.553 |
| 3/22/26 | 0.547 |
| 3/22/26 | 0.543 |
| 3/22/26 | 0.543 |
| 3/22/26 | 0.542 |
| 3/22/26 | 0.54 |
| 3/22/26 | 0.54 |
| 3/22/26 | 0.54 |
| 3/22/26 | 0.543 |
| 3/22/26 | 0.54 |
| 3/22/26 | 0.533 |
| 3/22/26 | 0.523 |
| 3/22/26 | 0.504 |
| 3/22/26 | 0.494 |
| 3/22/26 | 0.485 |
| 3/22/26 | 0.465 |
| 3/23/26 | 0.455 |
| 3/23/26 | 0.454 |
| 3/23/26 | 0.463 |
| 3/23/26 | 0.471 |
| 3/23/26 | 0.489 |
| 3/23/26 | 0.527 |
| 3/23/26 | 0.563 |
| 3/23/26 | 0.56 |
| 3/23/26 | 0.551 |
| 3/23/26 | 0.545 |
| 3/23/26 | 0.541 |
| 3/23/26 | 0.541 |
| 3/23/26 | 0.541 |
| 3/23/26 | 0.539 |
| 3/23/26 | 0.538 |
| 3/23/26 | 0.538 |
| 3/23/26 | 0.541 |
| 3/23/26 | 0.539 |
| 3/23/26 | 0.532 |
| 3/23/26 | 0.522 |
| 3/23/26 | 0.502 |
| 3/23/26 | 0.492 |
| 3/23/26 | 0.484 |
| 3/23/26 | 0.465 |
| 3/24/26 | 0.455 |
| 3/24/26 | 0.454 |
| 3/24/26 | 0.463 |
| 3/24/26 | 0.471 |
| 3/24/26 | 0.489 |
| 3/24/26 | 0.527 |
| 3/24/26 | 0.563 |
| 3/24/26 | 0.56 |
| 3/24/26 | 0.551 |
| 3/24/26 | 0.545 |
| 3/24/26 | 0.541 |
| 3/24/26 | 0.542 |
| 3/24/26 | 0.541 |
| 3/24/26 | 0.539 |
| 3/24/26 | 0.538 |
| 3/24/26 | 0.538 |
| 3/24/26 | 0.541 |
| 3/24/26 | 0.539 |
| 3/24/26 | 0.532 |
| 3/24/26 | 0.522 |
| 3/24/26 | 0.503 |
| 3/24/26 | 0.492 |
| 3/24/26 | 0.484 |
| 3/24/26 | 0.462 |
| 3/25/26 | 0.452 |
| 3/25/26 | 0.451 |
| 3/25/26 | 0.46 |
| 3/25/26 | 0.468 |
| 3/25/26 | 0.486 |
| 3/25/26 | 0.524 |
| 3/25/26 | 0.56 |
| 3/25/26 | 0.557 |
| 3/25/26 | 0.548 |
| 3/25/26 | 0.542 |
| 3/25/26 | 0.538 |
| 3/25/26 | 0.538 |
| 3/25/26 | 0.537 |
| 3/25/26 | 0.535 |
| 3/25/26 | 0.535 |
| 3/25/26 | 0.535 |
| 3/25/26 | 0.538 |
| 3/25/26 | 0.535 |
| 3/25/26 | 0.529 |
| 3/25/26 | 0.518 |
| 3/25/26 | 0.499 |
| 3/25/26 | 0.489 |
| 3/25/26 | 0.481 |
| 3/25/26 | 0.457 |
| 3/26/26 | 0.446 |
| 3/26/26 | 0.446 |
| 3/26/26 | 0.455 |
| 3/26/26 | 0.462 |
| 3/26/26 | 0.48 |
| 3/26/26 | 0.517 |
| 3/26/26 | 0.553 |
| 3/26/26 | 0.55 |
| 3/26/26 | 0.541 |
| 3/26/26 | 0.535 |
| 3/26/26 | 0.532 |
| 3/26/26 | 0.532 |
| 3/26/26 | 0.531 |
| 3/26/26 | 0.529 |
| 3/26/26 | 0.529 |
| 3/26/26 | 0.528 |
| 3/26/26 | 0.531 |
| 3/26/26 | 0.529 |
| 3/26/26 | 0.522 |
| 3/26/26 | 0.512 |
| 3/26/26 | 0.493 |
| 3/26/26 | 0.483 |
| 3/26/26 | 0.475 |
| 3/26/26 | 0.422 |
| 3/27/26 | 0.419 |
| 3/27/26 | 0.424 |
| 3/27/26 | 0.43 |
| 3/27/26 | 0.435 |
| 3/27/26 | 0.449 |
| 3/27/26 | 0.466 |
| 3/27/26 | 0.496 |
| 3/27/26 | 0.511 |
| 3/27/26 | 0.515 |
| 3/27/26 | 0.512 |
| 3/27/26 | 0.506 |
| 3/27/26 | 0.506 |
| 3/27/26 | 0.508 |
| 3/27/26 | 0.493 |
| 3/27/26 | 0.479 |
| 3/27/26 | 0.477 |
| 3/27/26 | 0.484 |
| 3/27/26 | 0.485 |
| 3/27/26 | 0.486 |
| 3/27/26 | 0.478 |
| 3/27/26 | 0.457 |
| 3/27/26 | 0.458 |
| 3/27/26 | 0.457 |
| 3/27/26 | 0.402 |
| 3/28/26 | 0.388 |
| 3/28/26 | 0.385 |
| 3/28/26 | 0.39 |
| 3/28/26 | 0.407 |
| 3/28/26 | 0.442 |
| 3/28/26 | 0.478 |
| 3/28/26 | 0.507 |
| 3/28/26 | 0.519 |
| 3/28/26 | 0.508 |
| 3/28/26 | 0.497 |
| 3/28/26 | 0.494 |
| 3/28/26 | 0.491 |
| 3/28/26 | 0.478 |
| 3/28/26 | 0.471 |
| 3/28/26 | 0.461 |
| 3/28/26 | 0.466 |
| 3/28/26 | 0.465 |
| 3/28/26 | 0.467 |
| 3/28/26 | 0.459 |
| 3/28/26 | 0.465 |
| 3/28/26 | 0.451 |
| 3/28/26 | 0.441 |
| 3/28/26 | 0.398 |
| 3/28/26 | 0.403 |
| 3/29/26 | 0.389 |
| 3/29/26 | 0.386 |
| 3/29/26 | 0.391 |
| 3/29/26 | 0.408 |
| 3/29/26 | 0.443 |
| 3/29/26 | 0.479 |
| 3/29/26 | 0.509 |
| 3/29/26 | 0.521 |
| 3/29/26 | 0.509 |
| 3/29/26 | 0.498 |
| 3/29/26 | 0.496 |
| 3/29/26 | 0.492 |
| 3/29/26 | 0.479 |
| 3/29/26 | 0.472 |
| 3/29/26 | 0.462 |
| 3/29/26 | 0.468 |
| 3/29/26 | 0.467 |
| 3/29/26 | 0.468 |
| 3/29/26 | 0.46 |
| 3/29/26 | 0.466 |
| 3/29/26 | 0.453 |
| 3/29/26 | 0.442 |
| 3/29/26 | 0.399 |
| 3/29/26 | 0.401 |
| 3/30/26 | 0.4 |
| 3/30/26 | 0.4 |
| 3/30/26 | 0.409 |
| 3/30/26 | 0.429 |
| 3/30/26 | 0.471 |
| 3/30/26 | 0.519 |
| 3/30/26 | 0.529 |
| 3/30/26 | 0.529 |
| 3/30/26 | 0.52 |
| 3/30/26 | 0.516 |
| 3/30/26 | 0.518 |
| 3/30/26 | 0.517 |
| 3/30/26 | 0.514 |
| 3/30/26 | 0.514 |
| 3/30/26 | 0.513 |
| 3/30/26 | 0.51 |
| 3/30/26 | 0.51 |
| 3/30/26 | 0.503 |
| 3/30/26 | 0.491 |
| 3/30/26 | 0.484 |
| 3/30/26 | 0.473 |
| 3/30/26 | 0.468 |
| 3/30/26 | 0.425 |
| 3/30/26 | 0.408 |
| 3/31/26 | 0.406 |
| 3/31/26 | 0.406 |
| 3/31/26 | 0.416 |
| 3/31/26 | 0.436 |
| 3/31/26 | 0.479 |
| 3/31/26 | 0.527 |
| 3/31/26 | 0.538 |
| 3/31/26 | 0.537 |
| 3/31/26 | 0.528 |
| 3/31/26 | 0.525 |
| 3/31/26 | 0.526 |
| 3/31/26 | 0.526 |
| 3/31/26 | 0.522 |
| 3/31/26 | 0.522 |
| 3/31/26 | 0.521 |
| 3/31/26 | 0.519 |
| 3/31/26 | 0.518 |
| 3/31/26 | 0.511 |
| 3/31/26 | 0.499 |
| 3/31/26 | 0.492 |
| 3/31/26 | 0.481 |
| 3/31/26 | 0.475 |
| 3/31/26 | 0.432 |